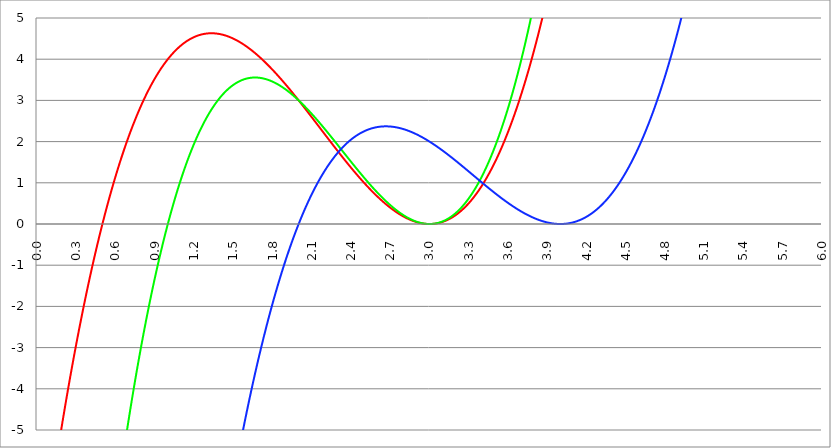
| Category | Series 1 | Series 0 | Series 2 |
|---|---|---|---|
| 0.0 | -9 | -27 | -64 |
| 0.003 | -8.928 | -26.865 | -63.808 |
| 0.006 | -8.856 | -26.731 | -63.617 |
| 0.009 | -8.785 | -26.597 | -63.426 |
| 0.012 | -8.714 | -26.463 | -63.235 |
| 0.015 | -8.643 | -26.33 | -63.044 |
| 0.018 | -8.572 | -26.197 | -62.854 |
| 0.021 | -8.502 | -26.064 | -62.665 |
| 0.024 | -8.431 | -25.932 | -62.475 |
| 0.027 | -8.361 | -25.8 | -62.287 |
| 0.03 | -8.292 | -25.669 | -62.098 |
| 0.033 | -8.222 | -25.538 | -61.91 |
| 0.036 | -8.153 | -25.407 | -61.722 |
| 0.039 | -8.084 | -25.277 | -61.534 |
| 0.042 | -8.015 | -25.147 | -61.347 |
| 0.045 | -7.946 | -25.017 | -61.16 |
| 0.048 | -7.878 | -24.888 | -60.974 |
| 0.051 | -7.81 | -24.759 | -60.788 |
| 0.054 | -7.742 | -24.631 | -60.602 |
| 0.057 | -7.674 | -24.503 | -60.417 |
| 0.06 | -7.606 | -24.375 | -60.232 |
| 0.063 | -7.539 | -24.248 | -60.047 |
| 0.066 | -7.472 | -24.121 | -59.863 |
| 0.069 | -7.405 | -23.994 | -59.679 |
| 0.072 | -7.339 | -23.868 | -59.495 |
| 0.075 | -7.272 | -23.742 | -59.312 |
| 0.078 | -7.206 | -23.616 | -59.129 |
| 0.081 | -7.14 | -23.491 | -58.946 |
| 0.084 | -7.075 | -23.366 | -58.764 |
| 0.087 | -7.009 | -23.242 | -58.582 |
| 0.09 | -6.944 | -23.118 | -58.401 |
| 0.093 | -6.879 | -22.994 | -58.219 |
| 0.096 | -6.814 | -22.871 | -58.039 |
| 0.099 | -6.749 | -22.748 | -57.858 |
| 0.102 | -6.685 | -22.625 | -57.678 |
| 0.105 | -6.621 | -22.503 | -57.498 |
| 0.108 | -6.557 | -22.381 | -57.319 |
| 0.111 | -6.493 | -22.26 | -57.14 |
| 0.114 | -6.43 | -22.138 | -56.961 |
| 0.117 | -6.367 | -22.018 | -56.783 |
| 0.12 | -6.304 | -21.897 | -56.605 |
| 0.123 | -6.241 | -21.777 | -56.427 |
| 0.126 | -6.178 | -21.657 | -56.25 |
| 0.129 | -6.116 | -21.538 | -56.073 |
| 0.132 | -6.054 | -21.419 | -55.896 |
| 0.135 | -5.992 | -21.3 | -55.72 |
| 0.138 | -5.93 | -21.182 | -55.544 |
| 0.141 | -5.869 | -21.064 | -55.368 |
| 0.144 | -5.808 | -20.946 | -55.193 |
| 0.147 | -5.747 | -20.829 | -55.018 |
| 0.15 | -5.686 | -20.712 | -54.843 |
| 0.153 | -5.625 | -20.596 | -54.669 |
| 0.156 | -5.565 | -20.48 | -54.495 |
| 0.159 | -5.505 | -20.364 | -54.322 |
| 0.162 | -5.445 | -20.248 | -54.148 |
| 0.165 | -5.385 | -20.133 | -53.976 |
| 0.168 | -5.325 | -20.018 | -53.803 |
| 0.171 | -5.266 | -19.904 | -53.631 |
| 0.174 | -5.207 | -19.79 | -53.459 |
| 0.177 | -5.148 | -19.676 | -53.287 |
| 0.18 | -5.09 | -19.563 | -53.116 |
| 0.183 | -5.031 | -19.45 | -52.946 |
| 0.186 | -4.973 | -19.337 | -52.775 |
| 0.189 | -4.915 | -19.225 | -52.605 |
| 0.192 | -4.857 | -19.113 | -52.435 |
| 0.195 | -4.799 | -19.001 | -52.266 |
| 0.198 | -4.742 | -18.89 | -52.097 |
| 0.201 | -4.685 | -18.779 | -51.928 |
| 0.204 | -4.628 | -18.668 | -51.759 |
| 0.207 | -4.571 | -18.558 | -51.591 |
| 0.21 | -4.515 | -18.448 | -51.423 |
| 0.213 | -4.458 | -18.339 | -51.256 |
| 0.216 | -4.402 | -18.23 | -51.089 |
| 0.219 | -4.346 | -18.121 | -50.922 |
| 0.222 | -4.291 | -18.012 | -50.756 |
| 0.225 | -4.235 | -17.904 | -50.59 |
| 0.228 | -4.18 | -17.796 | -50.424 |
| 0.231 | -4.125 | -17.689 | -50.259 |
| 0.234 | -4.07 | -17.581 | -50.093 |
| 0.237 | -4.016 | -17.475 | -49.929 |
| 0.24 | -3.961 | -17.368 | -49.764 |
| 0.243 | -3.907 | -17.262 | -49.6 |
| 0.246 | -3.853 | -17.156 | -49.437 |
| 0.249 | -3.799 | -17.051 | -49.273 |
| 0.252 | -3.746 | -16.946 | -49.11 |
| 0.255 | -3.692 | -16.841 | -48.947 |
| 0.258 | -3.639 | -16.736 | -48.785 |
| 0.261 | -3.586 | -16.632 | -48.623 |
| 0.264 | -3.533 | -16.528 | -48.461 |
| 0.267 | -3.481 | -16.425 | -48.3 |
| 0.27 | -3.428 | -16.322 | -48.139 |
| 0.273 | -3.376 | -16.219 | -47.978 |
| 0.276 | -3.324 | -16.117 | -47.817 |
| 0.279 | -3.272 | -16.015 | -47.657 |
| 0.282 | -3.221 | -15.913 | -47.498 |
| 0.285 | -3.17 | -15.811 | -47.338 |
| 0.288 | -3.118 | -15.71 | -47.179 |
| 0.291 | -3.068 | -15.609 | -47.02 |
| 0.294 | -3.017 | -15.509 | -46.862 |
| 0.297 | -2.966 | -15.409 | -46.704 |
| 0.3 | -2.916 | -15.309 | -46.546 |
| 0.303 | -2.866 | -15.21 | -46.389 |
| 0.306 | -2.816 | -15.11 | -46.231 |
| 0.309 | -2.766 | -15.012 | -46.075 |
| 0.312 | -2.717 | -14.913 | -45.918 |
| 0.315 | -2.667 | -14.815 | -45.762 |
| 0.318 | -2.618 | -14.717 | -45.606 |
| 0.321 | -2.569 | -14.62 | -45.451 |
| 0.324 | -2.521 | -14.522 | -45.295 |
| 0.327 | -2.472 | -14.426 | -45.141 |
| 0.33 | -2.424 | -14.329 | -44.986 |
| 0.333 | -2.376 | -14.233 | -44.832 |
| 0.336 | -2.328 | -14.137 | -44.678 |
| 0.339 | -2.28 | -14.041 | -44.525 |
| 0.342 | -2.233 | -13.946 | -44.371 |
| 0.345 | -2.185 | -13.851 | -44.218 |
| 0.348 | -2.138 | -13.757 | -44.066 |
| 0.351 | -2.091 | -13.662 | -43.914 |
| 0.354 | -2.044 | -13.569 | -43.762 |
| 0.357 | -1.998 | -13.475 | -43.61 |
| 0.36 | -1.951 | -13.382 | -43.459 |
| 0.363 | -1.905 | -13.289 | -43.308 |
| 0.366 | -1.859 | -13.196 | -43.157 |
| 0.369 | -1.814 | -13.104 | -43.007 |
| 0.372 | -1.768 | -13.012 | -42.857 |
| 0.375 | -1.723 | -12.92 | -42.707 |
| 0.378 | -1.677 | -12.829 | -42.558 |
| 0.381 | -1.632 | -12.737 | -42.409 |
| 0.384 | -1.588 | -12.647 | -42.26 |
| 0.387 | -1.543 | -12.556 | -42.111 |
| 0.39 | -1.499 | -12.466 | -41.963 |
| 0.393 | -1.454 | -12.376 | -41.816 |
| 0.396 | -1.41 | -12.287 | -41.668 |
| 0.399 | -1.367 | -12.198 | -41.521 |
| 0.402 | -1.323 | -12.109 | -41.374 |
| 0.405 | -1.279 | -12.02 | -41.228 |
| 0.408 | -1.236 | -11.932 | -41.081 |
| 0.411 | -1.193 | -11.844 | -40.936 |
| 0.414 | -1.15 | -11.756 | -40.79 |
| 0.417 | -1.108 | -11.669 | -40.645 |
| 0.42 | -1.065 | -11.582 | -40.5 |
| 0.423 | -1.023 | -11.495 | -40.355 |
| 0.426 | -0.981 | -11.409 | -40.211 |
| 0.429 | -0.939 | -11.323 | -40.067 |
| 0.432 | -0.897 | -11.237 | -39.923 |
| 0.435 | -0.855 | -11.152 | -39.78 |
| 0.438 | -0.814 | -11.067 | -39.637 |
| 0.441 | -0.773 | -10.982 | -39.494 |
| 0.444 | -0.732 | -10.897 | -39.352 |
| 0.447 | -0.691 | -10.813 | -39.21 |
| 0.45 | -0.65 | -10.729 | -39.068 |
| 0.453 | -0.61 | -10.646 | -38.926 |
| 0.456 | -0.57 | -10.562 | -38.785 |
| 0.459 | -0.529 | -10.479 | -38.644 |
| 0.462 | -0.49 | -10.396 | -38.504 |
| 0.465 | -0.45 | -10.314 | -38.363 |
| 0.468 | -0.41 | -10.232 | -38.223 |
| 0.471 | -0.371 | -10.15 | -38.084 |
| 0.474 | -0.332 | -10.069 | -37.945 |
| 0.477 | -0.293 | -9.988 | -37.806 |
| 0.48 | -0.254 | -9.907 | -37.667 |
| 0.483 | -0.215 | -9.826 | -37.528 |
| 0.486 | -0.177 | -9.746 | -37.39 |
| 0.489 | -0.139 | -9.666 | -37.253 |
| 0.492 | -0.101 | -9.586 | -37.115 |
| 0.495 | -0.063 | -9.507 | -36.978 |
| 0.498 | -0.025 | -9.428 | -36.841 |
| 0.501 | 0.012 | -9.349 | -36.705 |
| 0.504 | 0.05 | -9.27 | -36.568 |
| 0.507 | 0.087 | -9.192 | -36.432 |
| 0.51 | 0.124 | -9.114 | -36.297 |
| 0.513 | 0.161 | -9.037 | -36.161 |
| 0.516 | 0.197 | -8.959 | -36.026 |
| 0.519 | 0.234 | -8.882 | -35.892 |
| 0.522 | 0.27 | -8.805 | -35.757 |
| 0.525 | 0.306 | -8.729 | -35.623 |
| 0.528 | 0.342 | -8.653 | -35.489 |
| 0.531 | 0.378 | -8.577 | -35.356 |
| 0.534 | 0.414 | -8.501 | -35.223 |
| 0.537 | 0.449 | -8.426 | -35.09 |
| 0.54 | 0.484 | -8.351 | -34.957 |
| 0.543 | 0.519 | -8.277 | -34.825 |
| 0.546 | 0.554 | -8.202 | -34.693 |
| 0.549 | 0.589 | -8.128 | -34.561 |
| 0.552 | 0.623 | -8.054 | -34.43 |
| 0.555 | 0.658 | -7.981 | -34.299 |
| 0.558 | 0.692 | -7.907 | -34.168 |
| 0.561 | 0.726 | -7.834 | -34.037 |
| 0.564 | 0.76 | -7.762 | -33.907 |
| 0.567 | 0.793 | -7.689 | -33.777 |
| 0.57 | 0.827 | -7.617 | -33.648 |
| 0.573 | 0.86 | -7.546 | -33.518 |
| 0.576 | 0.893 | -7.474 | -33.389 |
| 0.579 | 0.926 | -7.403 | -33.261 |
| 0.582 | 0.959 | -7.332 | -33.132 |
| 0.585 | 0.991 | -7.261 | -33.004 |
| 0.588 | 1.024 | -7.191 | -32.876 |
| 0.591 | 1.056 | -7.121 | -32.749 |
| 0.594 | 1.088 | -7.051 | -32.622 |
| 0.597 | 1.12 | -6.981 | -32.495 |
| 0.6 | 1.152 | -6.912 | -32.368 |
| 0.603 | 1.184 | -6.843 | -32.242 |
| 0.606 | 1.215 | -6.774 | -32.116 |
| 0.609 | 1.246 | -6.706 | -31.99 |
| 0.612 | 1.277 | -6.638 | -31.864 |
| 0.615 | 1.308 | -6.57 | -31.739 |
| 0.618 | 1.339 | -6.502 | -31.614 |
| 0.621 | 1.37 | -6.435 | -31.49 |
| 0.624 | 1.4 | -6.368 | -31.366 |
| 0.627 | 1.43 | -6.301 | -31.242 |
| 0.63 | 1.46 | -6.235 | -31.118 |
| 0.633 | 1.49 | -6.169 | -30.995 |
| 0.636 | 1.52 | -6.103 | -30.871 |
| 0.639 | 1.55 | -6.037 | -30.749 |
| 0.642 | 1.579 | -5.972 | -30.626 |
| 0.645 | 1.608 | -5.907 | -30.504 |
| 0.648 | 1.637 | -5.842 | -30.382 |
| 0.651 | 1.666 | -5.777 | -30.26 |
| 0.654 | 1.695 | -5.713 | -30.139 |
| 0.657 | 1.724 | -5.649 | -30.018 |
| 0.66 | 1.752 | -5.585 | -29.897 |
| 0.663 | 1.78 | -5.522 | -29.777 |
| 0.666 | 1.809 | -5.458 | -29.656 |
| 0.669 | 1.837 | -5.396 | -29.536 |
| 0.672 | 1.864 | -5.333 | -29.417 |
| 0.675 | 1.892 | -5.27 | -29.297 |
| 0.678 | 1.919 | -5.208 | -29.178 |
| 0.681 | 1.947 | -5.147 | -29.06 |
| 0.684 | 1.974 | -5.085 | -28.941 |
| 0.687 | 2.001 | -5.024 | -28.823 |
| 0.69 | 2.028 | -4.963 | -28.705 |
| 0.693 | 2.054 | -4.902 | -28.587 |
| 0.696 | 2.081 | -4.841 | -28.47 |
| 0.699 | 2.107 | -4.781 | -28.353 |
| 0.702 | 2.133 | -4.721 | -28.236 |
| 0.705 | 2.159 | -4.661 | -28.12 |
| 0.708 | 2.185 | -4.602 | -28.003 |
| 0.711 | 2.211 | -4.543 | -27.888 |
| 0.714 | 2.237 | -4.484 | -27.772 |
| 0.717 | 2.262 | -4.425 | -27.657 |
| 0.72 | 2.287 | -4.367 | -27.542 |
| 0.723 | 2.312 | -4.309 | -27.427 |
| 0.726 | 2.337 | -4.251 | -27.312 |
| 0.729 | 2.362 | -4.193 | -27.198 |
| 0.732 | 2.387 | -4.136 | -27.084 |
| 0.735 | 2.411 | -4.079 | -26.97 |
| 0.738 | 2.436 | -4.022 | -26.857 |
| 0.741 | 2.46 | -3.965 | -26.744 |
| 0.744 | 2.484 | -3.909 | -26.631 |
| 0.747 | 2.508 | -3.853 | -26.519 |
| 0.75 | 2.531 | -3.797 | -26.406 |
| 0.753 | 2.555 | -3.741 | -26.294 |
| 0.756 | 2.578 | -3.686 | -26.183 |
| 0.759 | 2.601 | -3.631 | -26.071 |
| 0.762 | 2.625 | -3.576 | -25.96 |
| 0.765 | 2.647 | -3.522 | -25.849 |
| 0.768 | 2.67 | -3.467 | -25.739 |
| 0.771000000000001 | 2.693 | -3.413 | -25.628 |
| 0.774000000000001 | 2.715 | -3.36 | -25.518 |
| 0.777000000000001 | 2.738 | -3.306 | -25.408 |
| 0.78 | 2.76 | -3.253 | -25.299 |
| 0.783000000000001 | 2.782 | -3.2 | -25.19 |
| 0.786000000000001 | 2.804 | -3.147 | -25.081 |
| 0.789000000000001 | 2.826 | -3.094 | -24.972 |
| 0.792000000000001 | 2.847 | -3.042 | -24.864 |
| 0.795000000000001 | 2.869 | -2.99 | -24.756 |
| 0.798000000000001 | 2.89 | -2.938 | -24.648 |
| 0.801000000000001 | 2.911 | -2.887 | -24.54 |
| 0.804000000000001 | 2.932 | -2.836 | -24.433 |
| 0.807000000000001 | 2.953 | -2.785 | -24.326 |
| 0.810000000000001 | 2.974 | -2.734 | -24.219 |
| 0.813000000000001 | 2.994 | -2.683 | -24.113 |
| 0.816000000000001 | 3.015 | -2.633 | -24.006 |
| 0.819000000000001 | 3.035 | -2.583 | -23.901 |
| 0.822000000000001 | 3.055 | -2.533 | -23.795 |
| 0.825000000000001 | 3.075 | -2.484 | -23.689 |
| 0.828000000000001 | 3.095 | -2.434 | -23.584 |
| 0.831000000000001 | 3.114 | -2.385 | -23.48 |
| 0.834000000000001 | 3.134 | -2.336 | -23.375 |
| 0.837000000000001 | 3.153 | -2.288 | -23.271 |
| 0.840000000000001 | 3.173 | -2.239 | -23.167 |
| 0.843000000000001 | 3.192 | -2.191 | -23.063 |
| 0.846000000000001 | 3.211 | -2.144 | -22.959 |
| 0.849000000000001 | 3.23 | -2.096 | -22.856 |
| 0.852000000000001 | 3.248 | -2.049 | -22.753 |
| 0.855000000000001 | 3.267 | -2.001 | -22.65 |
| 0.858000000000001 | 3.285 | -1.955 | -22.548 |
| 0.861000000000001 | 3.303 | -1.908 | -22.446 |
| 0.864000000000001 | 3.321 | -1.861 | -22.344 |
| 0.867000000000001 | 3.339 | -1.815 | -22.242 |
| 0.870000000000001 | 3.357 | -1.769 | -22.141 |
| 0.873000000000001 | 3.375 | -1.724 | -22.04 |
| 0.876000000000001 | 3.393 | -1.678 | -21.939 |
| 0.879000000000001 | 3.41 | -1.633 | -21.839 |
| 0.882000000000001 | 3.427 | -1.588 | -21.738 |
| 0.885000000000001 | 3.444 | -1.543 | -21.638 |
| 0.888000000000001 | 3.461 | -1.499 | -21.538 |
| 0.891000000000001 | 3.478 | -1.454 | -21.439 |
| 0.894000000000001 | 3.495 | -1.41 | -21.34 |
| 0.897000000000001 | 3.512 | -1.367 | -21.241 |
| 0.900000000000001 | 3.528 | -1.323 | -21.142 |
| 0.903000000000001 | 3.544 | -1.28 | -21.044 |
| 0.906000000000001 | 3.56 | -1.237 | -20.945 |
| 0.909000000000001 | 3.577 | -1.194 | -20.847 |
| 0.912000000000001 | 3.592 | -1.151 | -20.75 |
| 0.915000000000001 | 3.608 | -1.109 | -20.652 |
| 0.918000000000001 | 3.624 | -1.066 | -20.555 |
| 0.921000000000001 | 3.639 | -1.024 | -20.458 |
| 0.924000000000001 | 3.655 | -0.983 | -20.362 |
| 0.927000000000001 | 3.67 | -0.941 | -20.265 |
| 0.930000000000001 | 3.685 | -0.9 | -20.169 |
| 0.933000000000001 | 3.7 | -0.859 | -20.073 |
| 0.936000000000001 | 3.715 | -0.818 | -19.978 |
| 0.939000000000001 | 3.729 | -0.777 | -19.883 |
| 0.942000000000001 | 3.744 | -0.737 | -19.787 |
| 0.945000000000001 | 3.758 | -0.697 | -19.693 |
| 0.948000000000001 | 3.773 | -0.657 | -19.598 |
| 0.951000000000001 | 3.787 | -0.617 | -19.504 |
| 0.954000000000001 | 3.801 | -0.578 | -19.41 |
| 0.957000000000001 | 3.815 | -0.538 | -19.316 |
| 0.960000000000001 | 3.829 | -0.499 | -19.223 |
| 0.963000000000001 | 3.842 | -0.461 | -19.129 |
| 0.966000000000001 | 3.856 | -0.422 | -19.036 |
| 0.969000000000001 | 3.869 | -0.384 | -18.944 |
| 0.972000000000001 | 3.882 | -0.345 | -18.851 |
| 0.975000000000001 | 3.896 | -0.308 | -18.759 |
| 0.978000000000001 | 3.909 | -0.27 | -18.667 |
| 0.981000000000001 | 3.921 | -0.232 | -18.575 |
| 0.984000000000001 | 3.934 | -0.195 | -18.484 |
| 0.987000000000001 | 3.947 | -0.158 | -18.392 |
| 0.990000000000001 | 3.959 | -0.121 | -18.301 |
| 0.993000000000001 | 3.972 | -0.085 | -18.211 |
| 0.996000000000001 | 3.984 | -0.048 | -18.12 |
| 0.999000000000001 | 3.996 | -0.012 | -18.03 |
| 1.002000000000001 | 4.008 | 0.024 | -17.94 |
| 1.005000000000001 | 4.02 | 0.06 | -17.85 |
| 1.008 | 4.032 | 0.095 | -17.761 |
| 1.011 | 4.043 | 0.131 | -17.672 |
| 1.014 | 4.055 | 0.166 | -17.583 |
| 1.017 | 4.066 | 0.201 | -17.494 |
| 1.02 | 4.077 | 0.235 | -17.406 |
| 1.023 | 4.088 | 0.27 | -17.317 |
| 1.026 | 4.099 | 0.304 | -17.229 |
| 1.029 | 4.11 | 0.338 | -17.142 |
| 1.032 | 4.121 | 0.372 | -17.054 |
| 1.034999999999999 | 4.132 | 0.405 | -16.967 |
| 1.037999999999999 | 4.142 | 0.439 | -16.88 |
| 1.040999999999999 | 4.152 | 0.472 | -16.793 |
| 1.043999999999999 | 4.163 | 0.505 | -16.707 |
| 1.046999999999999 | 4.173 | 0.538 | -16.621 |
| 1.049999999999999 | 4.183 | 0.57 | -16.535 |
| 1.052999999999999 | 4.193 | 0.603 | -16.449 |
| 1.055999999999999 | 4.202 | 0.635 | -16.364 |
| 1.058999999999999 | 4.212 | 0.667 | -16.278 |
| 1.061999999999998 | 4.222 | 0.699 | -16.193 |
| 1.064999999999998 | 4.231 | 0.73 | -16.109 |
| 1.067999999999998 | 4.24 | 0.761 | -16.024 |
| 1.070999999999998 | 4.249 | 0.793 | -15.94 |
| 1.073999999999998 | 4.258 | 0.824 | -15.856 |
| 1.076999999999998 | 4.267 | 0.854 | -15.772 |
| 1.079999999999998 | 4.276 | 0.885 | -15.689 |
| 1.082999999999998 | 4.285 | 0.915 | -15.605 |
| 1.085999999999998 | 4.294 | 0.945 | -15.522 |
| 1.088999999999998 | 4.302 | 0.975 | -15.439 |
| 1.091999999999997 | 4.31 | 1.005 | -15.357 |
| 1.094999999999997 | 4.319 | 1.034 | -15.275 |
| 1.097999999999997 | 4.327 | 1.064 | -15.193 |
| 1.100999999999997 | 4.335 | 1.093 | -15.111 |
| 1.103999999999997 | 4.343 | 1.122 | -15.029 |
| 1.106999999999997 | 4.35 | 1.15 | -14.948 |
| 1.109999999999997 | 4.358 | 1.179 | -14.867 |
| 1.112999999999997 | 4.366 | 1.207 | -14.786 |
| 1.115999999999997 | 4.373 | 1.235 | -14.705 |
| 1.118999999999996 | 4.38 | 1.263 | -14.625 |
| 1.121999999999996 | 4.387 | 1.291 | -14.545 |
| 1.124999999999996 | 4.395 | 1.318 | -14.465 |
| 1.127999999999996 | 4.402 | 1.346 | -14.385 |
| 1.130999999999996 | 4.408 | 1.373 | -14.306 |
| 1.133999999999996 | 4.415 | 1.4 | -14.227 |
| 1.136999999999996 | 4.422 | 1.426 | -14.148 |
| 1.139999999999996 | 4.428 | 1.453 | -14.069 |
| 1.142999999999996 | 4.435 | 1.479 | -13.99 |
| 1.145999999999995 | 4.441 | 1.506 | -13.912 |
| 1.148999999999995 | 4.447 | 1.532 | -13.834 |
| 1.151999999999995 | 4.453 | 1.557 | -13.756 |
| 1.154999999999995 | 4.459 | 1.583 | -13.679 |
| 1.157999999999995 | 4.465 | 1.608 | -13.602 |
| 1.160999999999995 | 4.471 | 1.633 | -13.525 |
| 1.163999999999995 | 4.477 | 1.658 | -13.448 |
| 1.166999999999995 | 4.482 | 1.683 | -13.371 |
| 1.169999999999995 | 4.488 | 1.708 | -13.295 |
| 1.172999999999994 | 4.493 | 1.732 | -13.219 |
| 1.175999999999994 | 4.498 | 1.757 | -13.143 |
| 1.178999999999994 | 4.503 | 1.781 | -13.067 |
| 1.181999999999994 | 4.508 | 1.805 | -12.992 |
| 1.184999999999994 | 4.513 | 1.828 | -12.916 |
| 1.187999999999994 | 4.518 | 1.852 | -12.842 |
| 1.190999999999994 | 4.523 | 1.875 | -12.767 |
| 1.193999999999994 | 4.527 | 1.898 | -12.692 |
| 1.196999999999994 | 4.532 | 1.921 | -12.618 |
| 1.199999999999993 | 4.536 | 1.944 | -12.544 |
| 1.202999999999993 | 4.54 | 1.967 | -12.47 |
| 1.205999999999993 | 4.544 | 1.989 | -12.397 |
| 1.208999999999993 | 4.548 | 2.011 | -12.323 |
| 1.211999999999993 | 4.552 | 2.033 | -12.25 |
| 1.214999999999993 | 4.556 | 2.055 | -12.177 |
| 1.217999999999993 | 4.56 | 2.077 | -12.105 |
| 1.220999999999993 | 4.564 | 2.098 | -12.032 |
| 1.223999999999993 | 4.567 | 2.12 | -11.96 |
| 1.226999999999993 | 4.571 | 2.141 | -11.888 |
| 1.229999999999992 | 4.574 | 2.162 | -11.816 |
| 1.232999999999992 | 4.577 | 2.182 | -11.745 |
| 1.235999999999992 | 4.58 | 2.203 | -11.673 |
| 1.238999999999992 | 4.583 | 2.224 | -11.602 |
| 1.241999999999992 | 4.586 | 2.244 | -11.532 |
| 1.244999999999992 | 4.589 | 2.264 | -11.461 |
| 1.247999999999992 | 4.592 | 2.284 | -11.391 |
| 1.250999999999992 | 4.595 | 2.303 | -11.32 |
| 1.253999999999992 | 4.597 | 2.323 | -11.25 |
| 1.256999999999991 | 4.6 | 2.342 | -11.181 |
| 1.259999999999991 | 4.602 | 2.362 | -11.111 |
| 1.262999999999991 | 4.604 | 2.381 | -11.042 |
| 1.265999999999991 | 4.606 | 2.399 | -10.973 |
| 1.268999999999991 | 4.608 | 2.418 | -10.904 |
| 1.271999999999991 | 4.61 | 2.437 | -10.836 |
| 1.274999999999991 | 4.612 | 2.455 | -10.767 |
| 1.277999999999991 | 4.614 | 2.473 | -10.699 |
| 1.280999999999991 | 4.616 | 2.491 | -10.631 |
| 1.28399999999999 | 4.617 | 2.509 | -10.563 |
| 1.28699999999999 | 4.619 | 2.526 | -10.496 |
| 1.28999999999999 | 4.62 | 2.544 | -10.429 |
| 1.29299999999999 | 4.621 | 2.561 | -10.362 |
| 1.29599999999999 | 4.623 | 2.578 | -10.295 |
| 1.29899999999999 | 4.624 | 2.595 | -10.228 |
| 1.30199999999999 | 4.625 | 2.612 | -10.162 |
| 1.30499999999999 | 4.626 | 2.629 | -10.096 |
| 1.30799999999999 | 4.626 | 2.645 | -10.03 |
| 1.310999999999989 | 4.627 | 2.662 | -9.964 |
| 1.313999999999989 | 4.628 | 2.678 | -9.898 |
| 1.316999999999989 | 4.628 | 2.694 | -9.833 |
| 1.319999999999989 | 4.629 | 2.71 | -9.768 |
| 1.322999999999989 | 4.629 | 2.725 | -9.703 |
| 1.325999999999989 | 4.629 | 2.741 | -9.639 |
| 1.328999999999989 | 4.63 | 2.756 | -9.574 |
| 1.331999999999989 | 4.63 | 2.771 | -9.51 |
| 1.334999999999989 | 4.63 | 2.786 | -9.446 |
| 1.337999999999988 | 4.63 | 2.801 | -9.382 |
| 1.340999999999988 | 4.629 | 2.816 | -9.319 |
| 1.343999999999988 | 4.629 | 2.83 | -9.255 |
| 1.346999999999988 | 4.629 | 2.844 | -9.192 |
| 1.349999999999988 | 4.628 | 2.859 | -9.129 |
| 1.352999999999988 | 4.628 | 2.873 | -9.067 |
| 1.355999999999988 | 4.627 | 2.887 | -9.004 |
| 1.358999999999988 | 4.626 | 2.9 | -8.942 |
| 1.361999999999988 | 4.626 | 2.914 | -8.88 |
| 1.364999999999987 | 4.625 | 2.927 | -8.818 |
| 1.367999999999987 | 4.624 | 2.94 | -8.756 |
| 1.370999999999987 | 4.623 | 2.954 | -8.695 |
| 1.373999999999987 | 4.621 | 2.966 | -8.634 |
| 1.376999999999987 | 4.62 | 2.979 | -8.573 |
| 1.379999999999987 | 4.619 | 2.992 | -8.512 |
| 1.382999999999987 | 4.618 | 3.004 | -8.451 |
| 1.385999999999987 | 4.616 | 3.017 | -8.391 |
| 1.388999999999987 | 4.614 | 3.029 | -8.331 |
| 1.391999999999987 | 4.613 | 3.041 | -8.271 |
| 1.394999999999986 | 4.611 | 3.053 | -8.211 |
| 1.397999999999986 | 4.609 | 3.064 | -8.152 |
| 1.400999999999986 | 4.607 | 3.076 | -8.092 |
| 1.403999999999986 | 4.605 | 3.087 | -8.033 |
| 1.406999999999986 | 4.603 | 3.098 | -7.974 |
| 1.409999999999986 | 4.601 | 3.11 | -7.916 |
| 1.412999999999986 | 4.599 | 3.121 | -7.857 |
| 1.415999999999986 | 4.597 | 3.131 | -7.799 |
| 1.418999999999986 | 4.594 | 3.142 | -7.741 |
| 1.421999999999985 | 4.592 | 3.152 | -7.683 |
| 1.424999999999985 | 4.589 | 3.163 | -7.625 |
| 1.427999999999985 | 4.587 | 3.173 | -7.568 |
| 1.430999999999985 | 4.584 | 3.183 | -7.511 |
| 1.433999999999985 | 4.581 | 3.193 | -7.453 |
| 1.436999999999985 | 4.578 | 3.203 | -7.397 |
| 1.439999999999985 | 4.575 | 3.212 | -7.34 |
| 1.442999999999985 | 4.572 | 3.222 | -7.284 |
| 1.445999999999985 | 4.569 | 3.231 | -7.227 |
| 1.448999999999984 | 4.566 | 3.24 | -7.171 |
| 1.451999999999984 | 4.563 | 3.249 | -7.116 |
| 1.454999999999984 | 4.559 | 3.258 | -7.06 |
| 1.457999999999984 | 4.556 | 3.267 | -7.005 |
| 1.460999999999984 | 4.552 | 3.276 | -6.949 |
| 1.463999999999984 | 4.549 | 3.284 | -6.894 |
| 1.466999999999984 | 4.545 | 3.292 | -6.84 |
| 1.469999999999984 | 4.541 | 3.301 | -6.785 |
| 1.472999999999984 | 4.538 | 3.309 | -6.731 |
| 1.475999999999984 | 4.534 | 3.317 | -6.676 |
| 1.478999999999983 | 4.53 | 3.324 | -6.622 |
| 1.481999999999983 | 4.526 | 3.332 | -6.569 |
| 1.484999999999983 | 4.522 | 3.34 | -6.515 |
| 1.487999999999983 | 4.517 | 3.347 | -6.462 |
| 1.490999999999983 | 4.513 | 3.354 | -6.408 |
| 1.493999999999983 | 4.509 | 3.361 | -6.355 |
| 1.496999999999983 | 4.504 | 3.368 | -6.303 |
| 1.499999999999983 | 4.5 | 3.375 | -6.25 |
| 1.502999999999983 | 4.495 | 3.382 | -6.198 |
| 1.505999999999982 | 4.491 | 3.388 | -6.145 |
| 1.508999999999982 | 4.486 | 3.395 | -6.093 |
| 1.511999999999982 | 4.481 | 3.401 | -6.042 |
| 1.514999999999982 | 4.477 | 3.407 | -5.99 |
| 1.517999999999982 | 4.472 | 3.413 | -5.939 |
| 1.520999999999982 | 4.467 | 3.419 | -5.887 |
| 1.523999999999982 | 4.462 | 3.425 | -5.836 |
| 1.526999999999982 | 4.457 | 3.43 | -5.785 |
| 1.529999999999982 | 4.451 | 3.436 | -5.735 |
| 1.532999999999981 | 4.446 | 3.441 | -5.684 |
| 1.535999999999981 | 4.441 | 3.446 | -5.634 |
| 1.538999999999981 | 4.436 | 3.452 | -5.584 |
| 1.541999999999981 | 4.43 | 3.456 | -5.534 |
| 1.544999999999981 | 4.425 | 3.461 | -5.485 |
| 1.547999999999981 | 4.419 | 3.466 | -5.435 |
| 1.550999999999981 | 4.413 | 3.471 | -5.386 |
| 1.553999999999981 | 4.408 | 3.475 | -5.337 |
| 1.556999999999981 | 4.402 | 3.479 | -5.288 |
| 1.559999999999981 | 4.396 | 3.484 | -5.239 |
| 1.56299999999998 | 4.39 | 3.488 | -5.191 |
| 1.56599999999998 | 4.384 | 3.492 | -5.142 |
| 1.56899999999998 | 4.378 | 3.496 | -5.094 |
| 1.57199999999998 | 4.372 | 3.499 | -5.046 |
| 1.57499999999998 | 4.366 | 3.503 | -4.999 |
| 1.57799999999998 | 4.36 | 3.506 | -4.951 |
| 1.58099999999998 | 4.353 | 3.51 | -4.904 |
| 1.58399999999998 | 4.347 | 3.513 | -4.856 |
| 1.58699999999998 | 4.341 | 3.516 | -4.809 |
| 1.589999999999979 | 4.334 | 3.519 | -4.763 |
| 1.592999999999979 | 4.328 | 3.522 | -4.716 |
| 1.595999999999979 | 4.321 | 3.525 | -4.67 |
| 1.598999999999979 | 4.314 | 3.527 | -4.623 |
| 1.601999999999979 | 4.308 | 3.53 | -4.577 |
| 1.604999999999979 | 4.301 | 3.532 | -4.531 |
| 1.607999999999979 | 4.294 | 3.534 | -4.486 |
| 1.610999999999979 | 4.287 | 3.536 | -4.44 |
| 1.613999999999978 | 4.28 | 3.538 | -4.395 |
| 1.616999999999978 | 4.273 | 3.54 | -4.35 |
| 1.619999999999978 | 4.266 | 3.542 | -4.305 |
| 1.622999999999978 | 4.259 | 3.544 | -4.26 |
| 1.625999999999978 | 4.251 | 3.545 | -4.216 |
| 1.628999999999978 | 4.244 | 3.547 | -4.171 |
| 1.631999999999978 | 4.237 | 3.548 | -4.127 |
| 1.634999999999978 | 4.23 | 3.549 | -4.083 |
| 1.637999999999978 | 4.222 | 3.551 | -4.039 |
| 1.640999999999977 | 4.215 | 3.552 | -3.996 |
| 1.643999999999977 | 4.207 | 3.552 | -3.952 |
| 1.646999999999977 | 4.199 | 3.553 | -3.909 |
| 1.649999999999977 | 4.192 | 3.554 | -3.866 |
| 1.652999999999977 | 4.184 | 3.554 | -3.823 |
| 1.655999999999977 | 4.176 | 3.555 | -3.78 |
| 1.658999999999977 | 4.168 | 3.555 | -3.738 |
| 1.661999999999977 | 4.161 | 3.555 | -3.695 |
| 1.664999999999977 | 4.153 | 3.556 | -3.653 |
| 1.667999999999977 | 4.145 | 3.556 | -3.611 |
| 1.670999999999976 | 4.137 | 3.555 | -3.569 |
| 1.673999999999976 | 4.128 | 3.555 | -3.527 |
| 1.676999999999976 | 4.12 | 3.555 | -3.486 |
| 1.679999999999976 | 4.112 | 3.554 | -3.445 |
| 1.682999999999976 | 4.104 | 3.554 | -3.404 |
| 1.685999999999976 | 4.095 | 3.553 | -3.363 |
| 1.688999999999976 | 4.087 | 3.553 | -3.322 |
| 1.691999999999976 | 4.079 | 3.552 | -3.281 |
| 1.694999999999976 | 4.07 | 3.551 | -3.241 |
| 1.697999999999975 | 4.062 | 3.55 | -3.201 |
| 1.700999999999975 | 4.053 | 3.549 | -3.161 |
| 1.703999999999975 | 4.045 | 3.547 | -3.121 |
| 1.706999999999975 | 4.036 | 3.546 | -3.081 |
| 1.709999999999975 | 4.027 | 3.545 | -3.042 |
| 1.712999999999975 | 4.018 | 3.543 | -3.002 |
| 1.715999999999975 | 4.01 | 3.541 | -2.963 |
| 1.718999999999975 | 4.001 | 3.54 | -2.924 |
| 1.721999999999975 | 3.992 | 3.538 | -2.885 |
| 1.724999999999974 | 3.983 | 3.536 | -2.847 |
| 1.727999999999974 | 3.974 | 3.534 | -2.808 |
| 1.730999999999974 | 3.965 | 3.532 | -2.77 |
| 1.733999999999974 | 3.956 | 3.529 | -2.732 |
| 1.736999999999974 | 3.946 | 3.527 | -2.694 |
| 1.739999999999974 | 3.937 | 3.524 | -2.656 |
| 1.742999999999974 | 3.928 | 3.522 | -2.618 |
| 1.745999999999974 | 3.919 | 3.519 | -2.581 |
| 1.748999999999974 | 3.909 | 3.517 | -2.544 |
| 1.751999999999974 | 3.9 | 3.514 | -2.507 |
| 1.754999999999973 | 3.891 | 3.511 | -2.47 |
| 1.757999999999973 | 3.881 | 3.508 | -2.433 |
| 1.760999999999973 | 3.872 | 3.505 | -2.396 |
| 1.763999999999973 | 3.862 | 3.501 | -2.36 |
| 1.766999999999973 | 3.852 | 3.498 | -2.324 |
| 1.769999999999973 | 3.843 | 3.495 | -2.288 |
| 1.772999999999973 | 3.833 | 3.491 | -2.252 |
| 1.775999999999973 | 3.823 | 3.488 | -2.216 |
| 1.778999999999973 | 3.814 | 3.484 | -2.18 |
| 1.781999999999972 | 3.804 | 3.48 | -2.145 |
| 1.784999999999972 | 3.794 | 3.477 | -2.11 |
| 1.787999999999972 | 3.784 | 3.473 | -2.075 |
| 1.790999999999972 | 3.774 | 3.469 | -2.04 |
| 1.793999999999972 | 3.764 | 3.464 | -2.005 |
| 1.796999999999972 | 3.754 | 3.46 | -1.97 |
| 1.799999999999972 | 3.744 | 3.456 | -1.936 |
| 1.802999999999972 | 3.734 | 3.452 | -1.902 |
| 1.805999999999972 | 3.724 | 3.447 | -1.868 |
| 1.808999999999971 | 3.714 | 3.443 | -1.834 |
| 1.811999999999971 | 3.703 | 3.438 | -1.8 |
| 1.814999999999971 | 3.693 | 3.433 | -1.766 |
| 1.817999999999971 | 3.683 | 3.429 | -1.733 |
| 1.820999999999971 | 3.672 | 3.424 | -1.7 |
| 1.823999999999971 | 3.662 | 3.419 | -1.667 |
| 1.826999999999971 | 3.652 | 3.414 | -1.634 |
| 1.829999999999971 | 3.641 | 3.409 | -1.601 |
| 1.832999999999971 | 3.631 | 3.403 | -1.568 |
| 1.83599999999997 | 3.62 | 3.398 | -1.536 |
| 1.83899999999997 | 3.61 | 3.393 | -1.504 |
| 1.84199999999997 | 3.599 | 3.387 | -1.472 |
| 1.84499999999997 | 3.589 | 3.382 | -1.44 |
| 1.84799999999997 | 3.578 | 3.376 | -1.408 |
| 1.85099999999997 | 3.567 | 3.37 | -1.376 |
| 1.85399999999997 | 3.556 | 3.365 | -1.345 |
| 1.85699999999997 | 3.546 | 3.359 | -1.313 |
| 1.85999999999997 | 3.535 | 3.353 | -1.282 |
| 1.86299999999997 | 3.524 | 3.347 | -1.251 |
| 1.865999999999969 | 3.513 | 3.341 | -1.22 |
| 1.868999999999969 | 3.502 | 3.335 | -1.19 |
| 1.871999999999969 | 3.491 | 3.329 | -1.159 |
| 1.874999999999969 | 3.48 | 3.322 | -1.129 |
| 1.877999999999969 | 3.469 | 3.316 | -1.099 |
| 1.880999999999969 | 3.458 | 3.309 | -1.069 |
| 1.883999999999969 | 3.447 | 3.303 | -1.039 |
| 1.886999999999969 | 3.436 | 3.296 | -1.009 |
| 1.889999999999969 | 3.425 | 3.29 | -0.979 |
| 1.892999999999968 | 3.414 | 3.283 | -0.95 |
| 1.895999999999968 | 3.403 | 3.276 | -0.921 |
| 1.898999999999968 | 3.392 | 3.269 | -0.892 |
| 1.901999999999968 | 3.381 | 3.262 | -0.863 |
| 1.904999999999968 | 3.369 | 3.255 | -0.834 |
| 1.907999999999968 | 3.358 | 3.248 | -0.805 |
| 1.910999999999968 | 3.347 | 3.241 | -0.777 |
| 1.913999999999968 | 3.335 | 3.234 | -0.748 |
| 1.916999999999968 | 3.324 | 3.227 | -0.72 |
| 1.919999999999967 | 3.313 | 3.219 | -0.692 |
| 1.922999999999967 | 3.301 | 3.212 | -0.664 |
| 1.925999999999967 | 3.29 | 3.204 | -0.637 |
| 1.928999999999967 | 3.278 | 3.197 | -0.609 |
| 1.931999999999967 | 3.267 | 3.189 | -0.582 |
| 1.934999999999967 | 3.255 | 3.182 | -0.554 |
| 1.937999999999967 | 3.244 | 3.174 | -0.527 |
| 1.940999999999967 | 3.232 | 3.166 | -0.5 |
| 1.943999999999967 | 3.221 | 3.158 | -0.473 |
| 1.946999999999967 | 3.209 | 3.15 | -0.447 |
| 1.949999999999966 | 3.197 | 3.142 | -0.42 |
| 1.952999999999966 | 3.186 | 3.134 | -0.394 |
| 1.955999999999966 | 3.174 | 3.126 | -0.368 |
| 1.958999999999966 | 3.162 | 3.118 | -0.342 |
| 1.961999999999966 | 3.15 | 3.11 | -0.316 |
| 1.964999999999966 | 3.139 | 3.101 | -0.29 |
| 1.967999999999966 | 3.127 | 3.093 | -0.264 |
| 1.970999999999966 | 3.115 | 3.084 | -0.239 |
| 1.973999999999966 | 3.103 | 3.076 | -0.213 |
| 1.976999999999965 | 3.091 | 3.067 | -0.188 |
| 1.979999999999965 | 3.08 | 3.059 | -0.163 |
| 1.982999999999965 | 3.068 | 3.05 | -0.138 |
| 1.985999999999965 | 3.056 | 3.041 | -0.114 |
| 1.988999999999965 | 3.044 | 3.033 | -0.089 |
| 1.991999999999965 | 3.032 | 3.024 | -0.065 |
| 1.994999999999965 | 3.02 | 3.015 | -0.04 |
| 1.997999999999965 | 3.008 | 3.006 | -0.016 |
| 2.000999999999965 | 2.996 | 2.997 | 0.008 |
| 2.003999999999965 | 2.984 | 2.988 | 0.032 |
| 2.006999999999965 | 2.972 | 2.979 | 0.056 |
| 2.009999999999965 | 2.96 | 2.97 | 0.079 |
| 2.012999999999965 | 2.948 | 2.96 | 0.103 |
| 2.015999999999965 | 2.936 | 2.951 | 0.126 |
| 2.018999999999965 | 2.924 | 2.942 | 0.149 |
| 2.021999999999966 | 2.912 | 2.933 | 0.172 |
| 2.024999999999966 | 2.899 | 2.923 | 0.195 |
| 2.027999999999966 | 2.887 | 2.914 | 0.218 |
| 2.030999999999966 | 2.875 | 2.904 | 0.24 |
| 2.033999999999966 | 2.863 | 2.895 | 0.263 |
| 2.036999999999966 | 2.851 | 2.885 | 0.285 |
| 2.039999999999966 | 2.839 | 2.875 | 0.307 |
| 2.042999999999966 | 2.826 | 2.866 | 0.329 |
| 2.045999999999967 | 2.814 | 2.856 | 0.351 |
| 2.048999999999967 | 2.802 | 2.846 | 0.373 |
| 2.051999999999967 | 2.79 | 2.836 | 0.395 |
| 2.054999999999967 | 2.777 | 2.826 | 0.416 |
| 2.057999999999967 | 2.765 | 2.816 | 0.437 |
| 2.060999999999967 | 2.753 | 2.807 | 0.459 |
| 2.063999999999967 | 2.74 | 2.796 | 0.48 |
| 2.066999999999967 | 2.728 | 2.786 | 0.501 |
| 2.069999999999967 | 2.716 | 2.776 | 0.521 |
| 2.072999999999968 | 2.703 | 2.766 | 0.542 |
| 2.075999999999968 | 2.691 | 2.756 | 0.563 |
| 2.078999999999968 | 2.679 | 2.746 | 0.583 |
| 2.081999999999968 | 2.666 | 2.735 | 0.603 |
| 2.084999999999968 | 2.654 | 2.725 | 0.623 |
| 2.087999999999968 | 2.642 | 2.715 | 0.643 |
| 2.090999999999968 | 2.629 | 2.704 | 0.663 |
| 2.093999999999968 | 2.617 | 2.694 | 0.683 |
| 2.096999999999968 | 2.604 | 2.684 | 0.703 |
| 2.099999999999969 | 2.592 | 2.673 | 0.722 |
| 2.102999999999969 | 2.58 | 2.662 | 0.741 |
| 2.105999999999969 | 2.567 | 2.652 | 0.76 |
| 2.108999999999969 | 2.555 | 2.641 | 0.78 |
| 2.111999999999969 | 2.542 | 2.631 | 0.798 |
| 2.114999999999969 | 2.53 | 2.62 | 0.817 |
| 2.117999999999969 | 2.517 | 2.609 | 0.836 |
| 2.120999999999969 | 2.505 | 2.598 | 0.854 |
| 2.123999999999969 | 2.492 | 2.588 | 0.873 |
| 2.12699999999997 | 2.48 | 2.577 | 0.891 |
| 2.12999999999997 | 2.467 | 2.566 | 0.909 |
| 2.13299999999997 | 2.455 | 2.555 | 0.927 |
| 2.13599999999997 | 2.443 | 2.544 | 0.945 |
| 2.13899999999997 | 2.43 | 2.533 | 0.963 |
| 2.14199999999997 | 2.418 | 2.522 | 0.98 |
| 2.14499999999997 | 2.405 | 2.511 | 0.998 |
| 2.14799999999997 | 2.393 | 2.5 | 1.015 |
| 2.15099999999997 | 2.38 | 2.489 | 1.032 |
| 2.153999999999971 | 2.368 | 2.478 | 1.05 |
| 2.156999999999971 | 2.355 | 2.467 | 1.067 |
| 2.159999999999971 | 2.343 | 2.455 | 1.083 |
| 2.162999999999971 | 2.33 | 2.444 | 1.1 |
| 2.165999999999971 | 2.318 | 2.433 | 1.117 |
| 2.168999999999971 | 2.305 | 2.422 | 1.133 |
| 2.171999999999971 | 2.293 | 2.411 | 1.15 |
| 2.174999999999971 | 2.28 | 2.399 | 1.166 |
| 2.177999999999971 | 2.268 | 2.388 | 1.182 |
| 2.180999999999972 | 2.255 | 2.377 | 1.198 |
| 2.183999999999972 | 2.243 | 2.365 | 1.214 |
| 2.186999999999972 | 2.23 | 2.354 | 1.229 |
| 2.189999999999972 | 2.218 | 2.342 | 1.245 |
| 2.192999999999972 | 2.205 | 2.331 | 1.26 |
| 2.195999999999972 | 2.193 | 2.319 | 1.276 |
| 2.198999999999972 | 2.18 | 2.308 | 1.291 |
| 2.201999999999972 | 2.168 | 2.296 | 1.306 |
| 2.204999999999972 | 2.155 | 2.285 | 1.321 |
| 2.207999999999972 | 2.143 | 2.273 | 1.336 |
| 2.210999999999973 | 2.13 | 2.262 | 1.351 |
| 2.213999999999973 | 2.118 | 2.25 | 1.365 |
| 2.216999999999973 | 2.105 | 2.238 | 1.38 |
| 2.219999999999973 | 2.093 | 2.227 | 1.394 |
| 2.222999999999973 | 2.08 | 2.215 | 1.408 |
| 2.225999999999973 | 2.068 | 2.203 | 1.422 |
| 2.228999999999973 | 2.056 | 2.192 | 1.436 |
| 2.231999999999974 | 2.043 | 2.18 | 1.45 |
| 2.234999999999974 | 2.031 | 2.168 | 1.464 |
| 2.237999999999974 | 2.018 | 2.157 | 1.478 |
| 2.240999999999974 | 2.006 | 2.145 | 1.491 |
| 2.243999999999974 | 1.994 | 2.133 | 1.505 |
| 2.246999999999974 | 1.981 | 2.121 | 1.518 |
| 2.249999999999974 | 1.969 | 2.109 | 1.531 |
| 2.252999999999974 | 1.956 | 2.098 | 1.544 |
| 2.255999999999974 | 1.944 | 2.086 | 1.557 |
| 2.258999999999975 | 1.932 | 2.074 | 1.57 |
| 2.261999999999975 | 1.919 | 2.062 | 1.583 |
| 2.264999999999975 | 1.907 | 2.05 | 1.595 |
| 2.267999999999975 | 1.895 | 2.038 | 1.608 |
| 2.270999999999975 | 1.882 | 2.026 | 1.62 |
| 2.273999999999975 | 1.87 | 2.014 | 1.633 |
| 2.276999999999975 | 1.858 | 2.003 | 1.645 |
| 2.279999999999975 | 1.846 | 1.991 | 1.657 |
| 2.282999999999975 | 1.833 | 1.979 | 1.669 |
| 2.285999999999976 | 1.821 | 1.967 | 1.68 |
| 2.288999999999976 | 1.809 | 1.955 | 1.692 |
| 2.291999999999976 | 1.797 | 1.943 | 1.704 |
| 2.294999999999976 | 1.784 | 1.931 | 1.715 |
| 2.297999999999976 | 1.772 | 1.919 | 1.726 |
| 2.300999999999976 | 1.76 | 1.907 | 1.738 |
| 2.303999999999976 | 1.748 | 1.895 | 1.749 |
| 2.306999999999976 | 1.736 | 1.883 | 1.76 |
| 2.309999999999976 | 1.723 | 1.871 | 1.771 |
| 2.312999999999977 | 1.711 | 1.859 | 1.782 |
| 2.315999999999977 | 1.699 | 1.847 | 1.792 |
| 2.318999999999977 | 1.687 | 1.835 | 1.803 |
| 2.321999999999977 | 1.675 | 1.823 | 1.813 |
| 2.324999999999977 | 1.663 | 1.811 | 1.824 |
| 2.327999999999977 | 1.651 | 1.799 | 1.834 |
| 2.330999999999977 | 1.639 | 1.787 | 1.844 |
| 2.333999999999977 | 1.627 | 1.775 | 1.854 |
| 2.336999999999977 | 1.615 | 1.763 | 1.864 |
| 2.339999999999978 | 1.603 | 1.751 | 1.874 |
| 2.342999999999978 | 1.591 | 1.739 | 1.884 |
| 2.345999999999978 | 1.579 | 1.727 | 1.893 |
| 2.348999999999978 | 1.567 | 1.715 | 1.903 |
| 2.351999999999978 | 1.555 | 1.703 | 1.912 |
| 2.354999999999978 | 1.543 | 1.691 | 1.921 |
| 2.357999999999978 | 1.532 | 1.679 | 1.93 |
| 2.360999999999978 | 1.52 | 1.667 | 1.94 |
| 2.363999999999979 | 1.508 | 1.655 | 1.948 |
| 2.366999999999979 | 1.496 | 1.643 | 1.957 |
| 2.369999999999979 | 1.484 | 1.631 | 1.966 |
| 2.372999999999979 | 1.473 | 1.619 | 1.975 |
| 2.375999999999979 | 1.461 | 1.607 | 1.983 |
| 2.378999999999979 | 1.449 | 1.595 | 1.992 |
| 2.381999999999979 | 1.438 | 1.583 | 2 |
| 2.384999999999979 | 1.426 | 1.572 | 2.008 |
| 2.387999999999979 | 1.414 | 1.56 | 2.016 |
| 2.39099999999998 | 1.403 | 1.548 | 2.025 |
| 2.39399999999998 | 1.391 | 1.536 | 2.032 |
| 2.39699999999998 | 1.38 | 1.524 | 2.04 |
| 2.39999999999998 | 1.368 | 1.512 | 2.048 |
| 2.40299999999998 | 1.356 | 1.5 | 2.056 |
| 2.40599999999998 | 1.345 | 1.488 | 2.063 |
| 2.40899999999998 | 1.334 | 1.476 | 2.071 |
| 2.41199999999998 | 1.322 | 1.465 | 2.078 |
| 2.41499999999998 | 1.311 | 1.453 | 2.085 |
| 2.417999999999981 | 1.299 | 1.441 | 2.092 |
| 2.420999999999981 | 1.288 | 1.429 | 2.099 |
| 2.423999999999981 | 1.277 | 1.417 | 2.106 |
| 2.426999999999981 | 1.265 | 1.406 | 2.113 |
| 2.429999999999981 | 1.254 | 1.394 | 2.12 |
| 2.432999999999981 | 1.243 | 1.382 | 2.126 |
| 2.435999999999981 | 1.232 | 1.37 | 2.133 |
| 2.438999999999981 | 1.22 | 1.359 | 2.139 |
| 2.441999999999981 | 1.209 | 1.347 | 2.146 |
| 2.444999999999982 | 1.198 | 1.335 | 2.152 |
| 2.447999999999982 | 1.187 | 1.324 | 2.158 |
| 2.450999999999982 | 1.176 | 1.312 | 2.164 |
| 2.453999999999982 | 1.165 | 1.3 | 2.17 |
| 2.456999999999982 | 1.154 | 1.289 | 2.176 |
| 2.459999999999982 | 1.143 | 1.277 | 2.182 |
| 2.462999999999982 | 1.132 | 1.266 | 2.188 |
| 2.465999999999982 | 1.121 | 1.254 | 2.193 |
| 2.468999999999983 | 1.11 | 1.243 | 2.199 |
| 2.471999999999983 | 1.1 | 1.231 | 2.204 |
| 2.474999999999983 | 1.089 | 1.22 | 2.209 |
| 2.477999999999983 | 1.078 | 1.208 | 2.215 |
| 2.480999999999983 | 1.067 | 1.197 | 2.22 |
| 2.483999999999983 | 1.057 | 1.185 | 2.225 |
| 2.486999999999983 | 1.046 | 1.174 | 2.23 |
| 2.489999999999983 | 1.035 | 1.163 | 2.234 |
| 2.492999999999983 | 1.025 | 1.151 | 2.239 |
| 2.495999999999984 | 1.014 | 1.14 | 2.244 |
| 2.498999999999984 | 1.004 | 1.129 | 2.248 |
| 2.501999999999984 | 0.993 | 1.118 | 2.253 |
| 2.504999999999984 | 0.983 | 1.106 | 2.257 |
| 2.507999999999984 | 0.972 | 1.095 | 2.262 |
| 2.510999999999984 | 0.962 | 1.084 | 2.266 |
| 2.513999999999984 | 0.951 | 1.073 | 2.27 |
| 2.516999999999984 | 0.941 | 1.062 | 2.274 |
| 2.519999999999984 | 0.931 | 1.051 | 2.278 |
| 2.522999999999985 | 0.921 | 1.04 | 2.282 |
| 2.525999999999985 | 0.91 | 1.029 | 2.286 |
| 2.528999999999985 | 0.9 | 1.018 | 2.289 |
| 2.531999999999985 | 0.89 | 1.007 | 2.293 |
| 2.534999999999985 | 0.88 | 0.996 | 2.296 |
| 2.537999999999985 | 0.87 | 0.985 | 2.3 |
| 2.540999999999985 | 0.86 | 0.974 | 2.303 |
| 2.543999999999985 | 0.85 | 0.963 | 2.306 |
| 2.546999999999985 | 0.84 | 0.952 | 2.31 |
| 2.549999999999986 | 0.83 | 0.942 | 2.313 |
| 2.552999999999986 | 0.82 | 0.931 | 2.316 |
| 2.555999999999986 | 0.811 | 0.92 | 2.319 |
| 2.558999999999986 | 0.801 | 0.91 | 2.322 |
| 2.561999999999986 | 0.791 | 0.899 | 2.324 |
| 2.564999999999986 | 0.781 | 0.888 | 2.327 |
| 2.567999999999986 | 0.772 | 0.878 | 2.33 |
| 2.570999999999986 | 0.762 | 0.867 | 2.332 |
| 2.573999999999987 | 0.753 | 0.857 | 2.334 |
| 2.576999999999987 | 0.743 | 0.847 | 2.337 |
| 2.579999999999987 | 0.734 | 0.836 | 2.339 |
| 2.582999999999987 | 0.724 | 0.826 | 2.341 |
| 2.585999999999987 | 0.715 | 0.816 | 2.343 |
| 2.588999999999987 | 0.706 | 0.805 | 2.345 |
| 2.591999999999987 | 0.696 | 0.795 | 2.347 |
| 2.594999999999987 | 0.687 | 0.785 | 2.349 |
| 2.597999999999987 | 0.678 | 0.775 | 2.351 |
| 2.600999999999987 | 0.669 | 0.765 | 2.353 |
| 2.603999999999988 | 0.66 | 0.755 | 2.354 |
| 2.606999999999988 | 0.651 | 0.745 | 2.356 |
| 2.609999999999988 | 0.642 | 0.735 | 2.357 |
| 2.612999999999988 | 0.633 | 0.725 | 2.359 |
| 2.615999999999988 | 0.624 | 0.715 | 2.36 |
| 2.618999999999988 | 0.615 | 0.705 | 2.361 |
| 2.621999999999988 | 0.606 | 0.695 | 2.362 |
| 2.624999999999988 | 0.598 | 0.686 | 2.363 |
| 2.627999999999988 | 0.589 | 0.676 | 2.364 |
| 2.630999999999989 | 0.58 | 0.666 | 2.365 |
| 2.633999999999989 | 0.572 | 0.657 | 2.366 |
| 2.636999999999989 | 0.563 | 0.647 | 2.367 |
| 2.639999999999989 | 0.555 | 0.638 | 2.367 |
| 2.642999999999989 | 0.546 | 0.628 | 2.368 |
| 2.645999999999989 | 0.538 | 0.619 | 2.369 |
| 2.648999999999989 | 0.53 | 0.609 | 2.369 |
| 2.651999999999989 | 0.521 | 0.6 | 2.37 |
| 2.654999999999989 | 0.513 | 0.591 | 2.37 |
| 2.65799999999999 | 0.505 | 0.582 | 2.37 |
| 2.66099999999999 | 0.497 | 0.573 | 2.37 |
| 2.66399999999999 | 0.489 | 0.564 | 2.37 |
| 2.66699999999999 | 0.481 | 0.555 | 2.37 |
| 2.66999999999999 | 0.473 | 0.546 | 2.37 |
| 2.67299999999999 | 0.465 | 0.537 | 2.37 |
| 2.67599999999999 | 0.457 | 0.528 | 2.37 |
| 2.67899999999999 | 0.449 | 0.519 | 2.37 |
| 2.681999999999991 | 0.441 | 0.51 | 2.369 |
| 2.684999999999991 | 0.434 | 0.502 | 2.369 |
| 2.687999999999991 | 0.426 | 0.493 | 2.369 |
| 2.690999999999991 | 0.418 | 0.484 | 2.368 |
| 2.693999999999991 | 0.411 | 0.476 | 2.367 |
| 2.696999999999991 | 0.403 | 0.467 | 2.367 |
| 2.699999999999991 | 0.396 | 0.459 | 2.366 |
| 2.702999999999991 | 0.389 | 0.451 | 2.365 |
| 2.705999999999991 | 0.381 | 0.442 | 2.364 |
| 2.708999999999992 | 0.374 | 0.434 | 2.363 |
| 2.711999999999992 | 0.367 | 0.426 | 2.362 |
| 2.714999999999992 | 0.36 | 0.418 | 2.361 |
| 2.717999999999992 | 0.353 | 0.41 | 2.36 |
| 2.720999999999992 | 0.346 | 0.402 | 2.359 |
| 2.723999999999992 | 0.339 | 0.394 | 2.358 |
| 2.726999999999992 | 0.332 | 0.386 | 2.356 |
| 2.729999999999992 | 0.325 | 0.378 | 2.355 |
| 2.732999999999992 | 0.318 | 0.371 | 2.353 |
| 2.735999999999993 | 0.312 | 0.363 | 2.352 |
| 2.738999999999993 | 0.305 | 0.355 | 2.35 |
| 2.741999999999993 | 0.298 | 0.348 | 2.349 |
| 2.744999999999993 | 0.292 | 0.34 | 2.347 |
| 2.747999999999993 | 0.286 | 0.333 | 2.345 |
| 2.750999999999993 | 0.279 | 0.326 | 2.343 |
| 2.753999999999993 | 0.273 | 0.318 | 2.341 |
| 2.756999999999993 | 0.267 | 0.311 | 2.339 |
| 2.759999999999993 | 0.26 | 0.304 | 2.337 |
| 2.762999999999994 | 0.254 | 0.297 | 2.335 |
| 2.765999999999994 | 0.248 | 0.29 | 2.333 |
| 2.768999999999994 | 0.242 | 0.283 | 2.331 |
| 2.771999999999994 | 0.236 | 0.276 | 2.328 |
| 2.774999999999994 | 0.23 | 0.27 | 2.326 |
| 2.777999999999994 | 0.225 | 0.263 | 2.324 |
| 2.780999999999994 | 0.219 | 0.256 | 2.321 |
| 2.783999999999994 | 0.213 | 0.25 | 2.319 |
| 2.786999999999995 | 0.208 | 0.243 | 2.316 |
| 2.789999999999995 | 0.202 | 0.237 | 2.313 |
| 2.792999999999995 | 0.197 | 0.23 | 2.311 |
| 2.795999999999995 | 0.191 | 0.224 | 2.308 |
| 2.798999999999995 | 0.186 | 0.218 | 2.305 |
| 2.801999999999995 | 0.18 | 0.212 | 2.302 |
| 2.804999999999995 | 0.175 | 0.206 | 2.299 |
| 2.807999999999995 | 0.17 | 0.2 | 2.296 |
| 2.810999999999995 | 0.165 | 0.194 | 2.293 |
| 2.813999999999996 | 0.16 | 0.188 | 2.29 |
| 2.816999999999996 | 0.155 | 0.183 | 2.287 |
| 2.819999999999996 | 0.15 | 0.177 | 2.284 |
| 2.822999999999996 | 0.146 | 0.171 | 2.28 |
| 2.825999999999996 | 0.141 | 0.166 | 2.277 |
| 2.828999999999996 | 0.136 | 0.16 | 2.274 |
| 2.831999999999996 | 0.132 | 0.155 | 2.27 |
| 2.834999999999996 | 0.127 | 0.15 | 2.267 |
| 2.837999999999996 | 0.123 | 0.145 | 2.263 |
| 2.840999999999997 | 0.118 | 0.14 | 2.259 |
| 2.843999999999997 | 0.114 | 0.135 | 2.256 |
| 2.846999999999997 | 0.11 | 0.13 | 2.252 |
| 2.849999999999997 | 0.106 | 0.125 | 2.248 |
| 2.852999999999997 | 0.102 | 0.12 | 2.244 |
| 2.855999999999997 | 0.098 | 0.115 | 2.241 |
| 2.858999999999997 | 0.094 | 0.111 | 2.237 |
| 2.861999999999997 | 0.09 | 0.106 | 2.233 |
| 2.864999999999997 | 0.086 | 0.102 | 2.229 |
| 2.867999999999998 | 0.083 | 0.098 | 2.225 |
| 2.870999999999998 | 0.079 | 0.093 | 2.22 |
| 2.873999999999998 | 0.075 | 0.089 | 2.216 |
| 2.876999999999998 | 0.072 | 0.085 | 2.212 |
| 2.879999999999998 | 0.069 | 0.081 | 2.208 |
| 2.882999999999998 | 0.065 | 0.077 | 2.203 |
| 2.885999999999998 | 0.062 | 0.074 | 2.199 |
| 2.888999999999998 | 0.059 | 0.07 | 2.195 |
| 2.891999999999999 | 0.056 | 0.066 | 2.19 |
| 2.894999999999999 | 0.053 | 0.063 | 2.186 |
| 2.897999999999999 | 0.05 | 0.059 | 2.181 |
| 2.900999999999999 | 0.047 | 0.056 | 2.176 |
| 2.904 | 0.044 | 0.053 | 2.172 |
| 2.906999999999999 | 0.042 | 0.049 | 2.167 |
| 2.909999999999999 | 0.039 | 0.046 | 2.162 |
| 2.912999999999999 | 0.037 | 0.043 | 2.158 |
| 2.915999999999999 | 0.034 | 0.041 | 2.153 |
| 2.919 | 0.032 | 0.038 | 2.148 |
| 2.922 | 0.029 | 0.035 | 2.143 |
| 2.925 | 0.027 | 0.032 | 2.138 |
| 2.928 | 0.025 | 0.03 | 2.133 |
| 2.931 | 0.023 | 0.028 | 2.128 |
| 2.934 | 0.021 | 0.025 | 2.123 |
| 2.937 | 0.019 | 0.023 | 2.118 |
| 2.94 | 0.018 | 0.021 | 2.112 |
| 2.943 | 0.016 | 0.019 | 2.107 |
| 2.946000000000001 | 0.014 | 0.017 | 2.102 |
| 2.949000000000001 | 0.013 | 0.015 | 2.097 |
| 2.952000000000001 | 0.011 | 0.013 | 2.091 |
| 2.955000000000001 | 0.01 | 0.012 | 2.086 |
| 2.958000000000001 | 0.009 | 0.01 | 2.08 |
| 2.961000000000001 | 0.007 | 0.009 | 2.075 |
| 2.964000000000001 | 0.006 | 0.008 | 2.069 |
| 2.967000000000001 | 0.005 | 0.006 | 2.064 |
| 2.970000000000001 | 0.004 | 0.005 | 2.058 |
| 2.973000000000002 | 0.004 | 0.004 | 2.053 |
| 2.976000000000002 | 0.003 | 0.003 | 2.047 |
| 2.979000000000002 | 0.002 | 0.003 | 2.041 |
| 2.982000000000002 | 0.002 | 0.002 | 2.035 |
| 2.985000000000002 | 0.001 | 0.001 | 2.03 |
| 2.988000000000002 | 0.001 | 0.001 | 2.024 |
| 2.991000000000002 | 0 | 0 | 2.018 |
| 2.994000000000002 | 0 | 0 | 2.012 |
| 2.997000000000003 | 0 | 0 | 2.006 |
| 3.000000000000003 | 0 | 0 | 2 |
| 3.003000000000003 | 0 | 0 | 1.994 |
| 3.006000000000003 | 0 | 0 | 1.988 |
| 3.009000000000003 | 0 | 0 | 1.982 |
| 3.012000000000003 | 0.001 | 0.001 | 1.976 |
| 3.015000000000003 | 0.001 | 0.001 | 1.97 |
| 3.018000000000003 | 0.002 | 0.002 | 1.963 |
| 3.021000000000003 | 0.002 | 0.003 | 1.957 |
| 3.024000000000004 | 0.003 | 0.003 | 1.951 |
| 3.027000000000004 | 0.004 | 0.004 | 1.945 |
| 3.030000000000004 | 0.005 | 0.005 | 1.938 |
| 3.033000000000004 | 0.006 | 0.007 | 1.932 |
| 3.036000000000004 | 0.007 | 0.008 | 1.926 |
| 3.039000000000004 | 0.008 | 0.009 | 1.919 |
| 3.042000000000004 | 0.009 | 0.011 | 1.913 |
| 3.045000000000004 | 0.01 | 0.012 | 1.906 |
| 3.048000000000004 | 0.012 | 0.014 | 1.9 |
| 3.051000000000005 | 0.013 | 0.016 | 1.893 |
| 3.054000000000005 | 0.015 | 0.018 | 1.886 |
| 3.057000000000005 | 0.017 | 0.02 | 1.88 |
| 3.060000000000005 | 0.018 | 0.022 | 1.873 |
| 3.063000000000005 | 0.02 | 0.025 | 1.867 |
| 3.066000000000005 | 0.022 | 0.027 | 1.86 |
| 3.069000000000005 | 0.024 | 0.03 | 1.853 |
| 3.072000000000005 | 0.027 | 0.032 | 1.846 |
| 3.075000000000005 | 0.029 | 0.035 | 1.84 |
| 3.078000000000006 | 0.031 | 0.038 | 1.833 |
| 3.081000000000006 | 0.034 | 0.041 | 1.826 |
| 3.084000000000006 | 0.036 | 0.044 | 1.819 |
| 3.087000000000006 | 0.039 | 0.047 | 1.812 |
| 3.090000000000006 | 0.042 | 0.051 | 1.805 |
| 3.093000000000006 | 0.045 | 0.054 | 1.798 |
| 3.096000000000006 | 0.048 | 0.058 | 1.791 |
| 3.099000000000006 | 0.051 | 0.062 | 1.784 |
| 3.102000000000007 | 0.054 | 0.066 | 1.777 |
| 3.105000000000007 | 0.057 | 0.07 | 1.77 |
| 3.108000000000007 | 0.061 | 0.074 | 1.763 |
| 3.111000000000007 | 0.064 | 0.078 | 1.756 |
| 3.114000000000007 | 0.068 | 0.082 | 1.749 |
| 3.117000000000007 | 0.072 | 0.087 | 1.742 |
| 3.120000000000007 | 0.075 | 0.092 | 1.735 |
| 3.123000000000007 | 0.079 | 0.096 | 1.727 |
| 3.126000000000007 | 0.083 | 0.101 | 1.72 |
| 3.129000000000008 | 0.087 | 0.106 | 1.713 |
| 3.132000000000008 | 0.092 | 0.111 | 1.706 |
| 3.135000000000008 | 0.096 | 0.117 | 1.698 |
| 3.138000000000008 | 0.1 | 0.122 | 1.691 |
| 3.141000000000008 | 0.105 | 0.128 | 1.684 |
| 3.144000000000008 | 0.11 | 0.133 | 1.676 |
| 3.147000000000008 | 0.114 | 0.139 | 1.669 |
| 3.150000000000008 | 0.119 | 0.145 | 1.662 |
| 3.153000000000008 | 0.124 | 0.151 | 1.654 |
| 3.156000000000009 | 0.129 | 0.157 | 1.647 |
| 3.159000000000009 | 0.134 | 0.164 | 1.639 |
| 3.162000000000009 | 0.14 | 0.17 | 1.632 |
| 3.165000000000009 | 0.145 | 0.177 | 1.625 |
| 3.16800000000001 | 0.151 | 0.184 | 1.617 |
| 3.171000000000009 | 0.156 | 0.19 | 1.61 |
| 3.174000000000009 | 0.162 | 0.197 | 1.602 |
| 3.177000000000009 | 0.168 | 0.205 | 1.594 |
| 3.180000000000009 | 0.174 | 0.212 | 1.587 |
| 3.18300000000001 | 0.18 | 0.219 | 1.579 |
| 3.18600000000001 | 0.186 | 0.227 | 1.572 |
| 3.18900000000001 | 0.192 | 0.235 | 1.564 |
| 3.19200000000001 | 0.198 | 0.242 | 1.556 |
| 3.19500000000001 | 0.205 | 0.25 | 1.549 |
| 3.19800000000001 | 0.212 | 0.259 | 1.541 |
| 3.20100000000001 | 0.218 | 0.267 | 1.533 |
| 3.20400000000001 | 0.225 | 0.275 | 1.526 |
| 3.20700000000001 | 0.232 | 0.284 | 1.518 |
| 3.210000000000011 | 0.239 | 0.292 | 1.51 |
| 3.213000000000011 | 0.246 | 0.301 | 1.503 |
| 3.216000000000011 | 0.253 | 0.31 | 1.495 |
| 3.219000000000011 | 0.261 | 0.319 | 1.487 |
| 3.222000000000011 | 0.268 | 0.329 | 1.479 |
| 3.225000000000011 | 0.276 | 0.338 | 1.472 |
| 3.228000000000011 | 0.284 | 0.347 | 1.464 |
| 3.231000000000011 | 0.291 | 0.357 | 1.456 |
| 3.234000000000012 | 0.299 | 0.367 | 1.448 |
| 3.237000000000012 | 0.307 | 0.377 | 1.44 |
| 3.240000000000012 | 0.316 | 0.387 | 1.432 |
| 3.243000000000012 | 0.324 | 0.397 | 1.425 |
| 3.246000000000012 | 0.332 | 0.408 | 1.417 |
| 3.249000000000012 | 0.341 | 0.418 | 1.409 |
| 3.252000000000012 | 0.35 | 0.429 | 1.401 |
| 3.255000000000012 | 0.358 | 0.44 | 1.393 |
| 3.258000000000012 | 0.367 | 0.451 | 1.385 |
| 3.261000000000012 | 0.376 | 0.462 | 1.377 |
| 3.264000000000012 | 0.385 | 0.473 | 1.369 |
| 3.267000000000012 | 0.395 | 0.485 | 1.361 |
| 3.270000000000013 | 0.404 | 0.496 | 1.354 |
| 3.273000000000013 | 0.413 | 0.508 | 1.346 |
| 3.276000000000013 | 0.423 | 0.52 | 1.338 |
| 3.279000000000013 | 0.433 | 0.532 | 1.33 |
| 3.282000000000013 | 0.442 | 0.544 | 1.322 |
| 3.285000000000013 | 0.452 | 0.557 | 1.314 |
| 3.288000000000013 | 0.462 | 0.569 | 1.306 |
| 3.291000000000014 | 0.473 | 0.582 | 1.298 |
| 3.294000000000014 | 0.483 | 0.595 | 1.29 |
| 3.297000000000014 | 0.493 | 0.608 | 1.282 |
| 3.300000000000014 | 0.504 | 0.621 | 1.274 |
| 3.303000000000014 | 0.515 | 0.634 | 1.266 |
| 3.306000000000014 | 0.525 | 0.648 | 1.258 |
| 3.309000000000014 | 0.536 | 0.661 | 1.25 |
| 3.312000000000014 | 0.547 | 0.675 | 1.242 |
| 3.315000000000015 | 0.559 | 0.689 | 1.234 |
| 3.318000000000015 | 0.57 | 0.703 | 1.226 |
| 3.321000000000015 | 0.581 | 0.717 | 1.218 |
| 3.324000000000015 | 0.593 | 0.732 | 1.21 |
| 3.327000000000015 | 0.605 | 0.746 | 1.202 |
| 3.330000000000015 | 0.616 | 0.761 | 1.194 |
| 3.333000000000015 | 0.628 | 0.776 | 1.186 |
| 3.336000000000015 | 0.64 | 0.791 | 1.178 |
| 3.339000000000015 | 0.653 | 0.806 | 1.17 |
| 3.342000000000016 | 0.665 | 0.822 | 1.162 |
| 3.345000000000016 | 0.677 | 0.837 | 1.154 |
| 3.348000000000016 | 0.69 | 0.853 | 1.146 |
| 3.351000000000016 | 0.702 | 0.869 | 1.138 |
| 3.354000000000016 | 0.715 | 0.885 | 1.13 |
| 3.357000000000016 | 0.728 | 0.901 | 1.122 |
| 3.360000000000016 | 0.741 | 0.918 | 1.114 |
| 3.363000000000016 | 0.755 | 0.934 | 1.106 |
| 3.366000000000016 | 0.768 | 0.951 | 1.098 |
| 3.369000000000017 | 0.781 | 0.968 | 1.09 |
| 3.372000000000017 | 0.795 | 0.985 | 1.082 |
| 3.375000000000017 | 0.809 | 1.002 | 1.074 |
| 3.378000000000017 | 0.822 | 1.019 | 1.066 |
| 3.381000000000017 | 0.836 | 1.037 | 1.058 |
| 3.384000000000017 | 0.851 | 1.055 | 1.05 |
| 3.387000000000017 | 0.865 | 1.072 | 1.042 |
| 3.390000000000017 | 0.879 | 1.091 | 1.034 |
| 3.393000000000017 | 0.894 | 1.109 | 1.026 |
| 3.396000000000018 | 0.908 | 1.127 | 1.019 |
| 3.399000000000018 | 0.923 | 1.146 | 1.011 |
| 3.402000000000018 | 0.938 | 1.165 | 1.003 |
| 3.405000000000018 | 0.953 | 1.183 | 0.995 |
| 3.408000000000018 | 0.968 | 1.203 | 0.987 |
| 3.411000000000018 | 0.983 | 1.222 | 0.979 |
| 3.414000000000018 | 0.999 | 1.241 | 0.971 |
| 3.417000000000018 | 1.014 | 1.261 | 0.963 |
| 3.420000000000019 | 1.03 | 1.281 | 0.955 |
| 3.423000000000019 | 1.046 | 1.301 | 0.948 |
| 3.426000000000019 | 1.062 | 1.321 | 0.94 |
| 3.429000000000019 | 1.078 | 1.341 | 0.932 |
| 3.432000000000019 | 1.094 | 1.362 | 0.924 |
| 3.435000000000019 | 1.111 | 1.382 | 0.916 |
| 3.438000000000019 | 1.127 | 1.403 | 0.908 |
| 3.441000000000019 | 1.144 | 1.424 | 0.901 |
| 3.444000000000019 | 1.161 | 1.445 | 0.893 |
| 3.44700000000002 | 1.178 | 1.467 | 0.885 |
| 3.45000000000002 | 1.195 | 1.488 | 0.877 |
| 3.45300000000002 | 1.212 | 1.51 | 0.87 |
| 3.45600000000002 | 1.229 | 1.532 | 0.862 |
| 3.45900000000002 | 1.247 | 1.554 | 0.854 |
| 3.46200000000002 | 1.264 | 1.576 | 0.846 |
| 3.46500000000002 | 1.282 | 1.599 | 0.839 |
| 3.46800000000002 | 1.3 | 1.622 | 0.831 |
| 3.47100000000002 | 1.318 | 1.645 | 0.823 |
| 3.474000000000021 | 1.336 | 1.668 | 0.816 |
| 3.477000000000021 | 1.355 | 1.691 | 0.808 |
| 3.480000000000021 | 1.373 | 1.714 | 0.8 |
| 3.483000000000021 | 1.392 | 1.738 | 0.793 |
| 3.486000000000021 | 1.411 | 1.762 | 0.785 |
| 3.489000000000021 | 1.429 | 1.786 | 0.778 |
| 3.492000000000021 | 1.449 | 1.81 | 0.77 |
| 3.495000000000021 | 1.468 | 1.834 | 0.763 |
| 3.498000000000021 | 1.487 | 1.859 | 0.755 |
| 3.501000000000022 | 1.507 | 1.883 | 0.748 |
| 3.504000000000022 | 1.526 | 1.908 | 0.74 |
| 3.507000000000022 | 1.546 | 1.933 | 0.733 |
| 3.510000000000022 | 1.566 | 1.959 | 0.725 |
| 3.513000000000022 | 1.586 | 1.984 | 0.718 |
| 3.516000000000022 | 1.606 | 2.01 | 0.71 |
| 3.519000000000022 | 1.626 | 2.036 | 0.703 |
| 3.522000000000022 | 1.647 | 2.062 | 0.696 |
| 3.525000000000023 | 1.668 | 2.088 | 0.688 |
| 3.528000000000023 | 1.688 | 2.114 | 0.681 |
| 3.531000000000023 | 1.709 | 2.141 | 0.674 |
| 3.534000000000023 | 1.73 | 2.168 | 0.666 |
| 3.537000000000023 | 1.752 | 2.195 | 0.659 |
| 3.540000000000023 | 1.773 | 2.222 | 0.652 |
| 3.543000000000023 | 1.794 | 2.249 | 0.645 |
| 3.546000000000023 | 1.816 | 2.277 | 0.637 |
| 3.549000000000023 | 1.838 | 2.305 | 0.63 |
| 3.552000000000024 | 1.86 | 2.333 | 0.623 |
| 3.555000000000024 | 1.882 | 2.361 | 0.616 |
| 3.558000000000024 | 1.904 | 2.389 | 0.609 |
| 3.561000000000024 | 1.927 | 2.418 | 0.602 |
| 3.564000000000024 | 1.949 | 2.447 | 0.595 |
| 3.567000000000024 | 1.972 | 2.476 | 0.588 |
| 3.570000000000024 | 1.995 | 2.505 | 0.581 |
| 3.573000000000024 | 2.018 | 2.534 | 0.574 |
| 3.576000000000024 | 2.041 | 2.564 | 0.567 |
| 3.579000000000025 | 2.064 | 2.594 | 0.56 |
| 3.582000000000025 | 2.088 | 2.624 | 0.553 |
| 3.585000000000025 | 2.112 | 2.654 | 0.546 |
| 3.588000000000025 | 2.135 | 2.684 | 0.539 |
| 3.591000000000025 | 2.159 | 2.715 | 0.532 |
| 3.594000000000025 | 2.183 | 2.746 | 0.525 |
| 3.597000000000025 | 2.208 | 2.777 | 0.519 |
| 3.600000000000025 | 2.232 | 2.808 | 0.512 |
| 3.603000000000025 | 2.257 | 2.839 | 0.505 |
| 3.606000000000026 | 2.281 | 2.871 | 0.499 |
| 3.609000000000026 | 2.306 | 2.903 | 0.492 |
| 3.612000000000026 | 2.331 | 2.935 | 0.485 |
| 3.615000000000026 | 2.356 | 2.967 | 0.479 |
| 3.618000000000026 | 2.382 | 3 | 0.472 |
| 3.621000000000026 | 2.407 | 3.032 | 0.466 |
| 3.624000000000026 | 2.433 | 3.065 | 0.459 |
| 3.627000000000026 | 2.459 | 3.098 | 0.453 |
| 3.630000000000026 | 2.485 | 3.132 | 0.446 |
| 3.633000000000027 | 2.511 | 3.165 | 0.44 |
| 3.636000000000027 | 2.537 | 3.199 | 0.434 |
| 3.639000000000027 | 2.563 | 3.233 | 0.427 |
| 3.642000000000027 | 2.59 | 3.267 | 0.421 |
| 3.645000000000027 | 2.617 | 3.301 | 0.415 |
| 3.648000000000027 | 2.644 | 3.336 | 0.408 |
| 3.651000000000027 | 2.671 | 3.37 | 0.402 |
| 3.654000000000027 | 2.698 | 3.405 | 0.396 |
| 3.657000000000027 | 2.725 | 3.441 | 0.39 |
| 3.660000000000028 | 2.753 | 3.476 | 0.384 |
| 3.663000000000028 | 2.781 | 3.512 | 0.378 |
| 3.666000000000028 | 2.809 | 3.548 | 0.372 |
| 3.669000000000028 | 2.837 | 3.584 | 0.366 |
| 3.672000000000028 | 2.865 | 3.62 | 0.36 |
| 3.675000000000028 | 2.893 | 3.656 | 0.354 |
| 3.678000000000028 | 2.922 | 3.693 | 0.348 |
| 3.681000000000028 | 2.95 | 3.73 | 0.342 |
| 3.684000000000028 | 2.979 | 3.767 | 0.336 |
| 3.687000000000029 | 3.008 | 3.805 | 0.331 |
| 3.690000000000029 | 3.038 | 3.842 | 0.325 |
| 3.693000000000029 | 3.067 | 3.88 | 0.319 |
| 3.696000000000029 | 3.096 | 3.918 | 0.313 |
| 3.699000000000029 | 3.126 | 3.956 | 0.308 |
| 3.702000000000029 | 3.156 | 3.995 | 0.302 |
| 3.705000000000029 | 3.186 | 4.033 | 0.297 |
| 3.708000000000029 | 3.216 | 4.072 | 0.291 |
| 3.71100000000003 | 3.246 | 4.111 | 0.286 |
| 3.71400000000003 | 3.277 | 4.151 | 0.28 |
| 3.71700000000003 | 3.308 | 4.19 | 0.275 |
| 3.72000000000003 | 3.338 | 4.23 | 0.27 |
| 3.72300000000003 | 3.37 | 4.27 | 0.264 |
| 3.72600000000003 | 3.401 | 4.31 | 0.259 |
| 3.72900000000003 | 3.432 | 4.351 | 0.254 |
| 3.73200000000003 | 3.464 | 4.392 | 0.249 |
| 3.73500000000003 | 3.495 | 4.433 | 0.244 |
| 3.738000000000031 | 3.527 | 4.474 | 0.239 |
| 3.741000000000031 | 3.559 | 4.515 | 0.234 |
| 3.744000000000031 | 3.591 | 4.557 | 0.229 |
| 3.747000000000031 | 3.624 | 4.599 | 0.224 |
| 3.750000000000031 | 3.656 | 4.641 | 0.219 |
| 3.753000000000031 | 3.689 | 4.683 | 0.214 |
| 3.756000000000031 | 3.722 | 4.725 | 0.209 |
| 3.759000000000031 | 3.755 | 4.768 | 0.204 |
| 3.762000000000031 | 3.788 | 4.811 | 0.2 |
| 3.765000000000032 | 3.822 | 4.854 | 0.195 |
| 3.768000000000032 | 3.855 | 4.898 | 0.19 |
| 3.771000000000032 | 3.889 | 4.942 | 0.186 |
| 3.774000000000032 | 3.923 | 4.986 | 0.181 |
| 3.777000000000032 | 3.957 | 5.03 | 0.177 |
| 3.780000000000032 | 3.991 | 5.074 | 0.172 |
| 3.783000000000032 | 4.026 | 5.119 | 0.168 |
| 3.786000000000032 | 4.06 | 5.164 | 0.164 |
| 3.789000000000032 | 4.095 | 5.209 | 0.159 |
| 3.792000000000033 | 4.13 | 5.254 | 0.155 |
| 3.795000000000033 | 4.165 | 5.3 | 0.151 |
| 3.798000000000033 | 4.2 | 5.345 | 0.147 |
| 3.801000000000033 | 4.236 | 5.391 | 0.143 |
| 3.804000000000033 | 4.272 | 5.438 | 0.139 |
| 3.807000000000033 | 4.307 | 5.484 | 0.135 |
| 3.810000000000033 | 4.343 | 5.531 | 0.131 |
| 3.813000000000033 | 4.38 | 5.578 | 0.127 |
| 3.816000000000034 | 4.416 | 5.625 | 0.123 |
| 3.819000000000034 | 4.453 | 5.673 | 0.119 |
| 3.822000000000034 | 4.489 | 5.72 | 0.115 |
| 3.825000000000034 | 4.526 | 5.768 | 0.112 |
| 3.828000000000034 | 4.563 | 5.816 | 0.108 |
| 3.831000000000034 | 4.601 | 5.865 | 0.105 |
| 3.834000000000034 | 4.638 | 5.914 | 0.101 |
| 3.837000000000034 | 4.676 | 5.963 | 0.098 |
| 3.840000000000034 | 4.713 | 6.012 | 0.094 |
| 3.843000000000035 | 4.751 | 6.061 | 0.091 |
| 3.846000000000035 | 4.79 | 6.111 | 0.088 |
| 3.849000000000035 | 4.828 | 6.161 | 0.084 |
| 3.852000000000035 | 4.866 | 6.211 | 0.081 |
| 3.855000000000035 | 4.905 | 6.261 | 0.078 |
| 3.858000000000035 | 4.944 | 6.312 | 0.075 |
| 3.861000000000035 | 4.983 | 6.363 | 0.072 |
| 3.864000000000035 | 5.022 | 6.414 | 0.069 |
| 3.867000000000035 | 5.062 | 6.465 | 0.066 |
| 3.870000000000036 | 5.102 | 6.517 | 0.063 |
| 3.873000000000036 | 5.141 | 6.569 | 0.06 |
| 3.876000000000036 | 5.181 | 6.621 | 0.058 |
| 3.879000000000036 | 5.222 | 6.673 | 0.055 |
| 3.882000000000036 | 5.262 | 6.726 | 0.052 |
| 3.885000000000036 | 5.302 | 6.779 | 0.05 |
| 3.888000000000036 | 5.343 | 6.832 | 0.047 |
| 3.891000000000036 | 5.384 | 6.885 | 0.045 |
| 3.894000000000036 | 5.425 | 6.939 | 0.043 |
| 3.897000000000037 | 5.467 | 6.993 | 0.04 |
| 3.900000000000037 | 5.508 | 7.047 | 0.038 |
| 3.903000000000037 | 5.55 | 7.101 | 0.036 |
| 3.906000000000037 | 5.592 | 7.156 | 0.034 |
| 3.909000000000037 | 5.634 | 7.211 | 0.032 |
| 3.912000000000037 | 5.676 | 7.266 | 0.03 |
| 3.915000000000037 | 5.718 | 7.322 | 0.028 |
| 3.918000000000037 | 5.761 | 7.377 | 0.026 |
| 3.921000000000038 | 5.804 | 7.433 | 0.024 |
| 3.924000000000038 | 5.847 | 7.489 | 0.022 |
| 3.927000000000038 | 5.89 | 7.546 | 0.021 |
| 3.930000000000038 | 5.933 | 7.602 | 0.019 |
| 3.933000000000038 | 5.977 | 7.659 | 0.017 |
| 3.936000000000038 | 6.021 | 7.717 | 0.016 |
| 3.939000000000038 | 6.064 | 7.774 | 0.014 |
| 3.942000000000038 | 6.109 | 7.832 | 0.013 |
| 3.945000000000038 | 6.153 | 7.89 | 0.012 |
| 3.948000000000039 | 6.197 | 7.948 | 0.011 |
| 3.951000000000039 | 6.242 | 8.007 | 0.009 |
| 3.954000000000039 | 6.287 | 8.065 | 0.008 |
| 3.957000000000039 | 6.332 | 8.124 | 0.007 |
| 3.96000000000004 | 6.377 | 8.184 | 0.006 |
| 3.96300000000004 | 6.423 | 8.243 | 0.005 |
| 3.966000000000039 | 6.469 | 8.303 | 0.005 |
| 3.969000000000039 | 6.515 | 8.363 | 0.004 |
| 3.972000000000039 | 6.561 | 8.424 | 0.003 |
| 3.97500000000004 | 6.607 | 8.484 | 0.002 |
| 3.97800000000004 | 6.653 | 8.545 | 0.002 |
| 3.98100000000004 | 6.7 | 8.606 | 0.001 |
| 3.98400000000004 | 6.747 | 8.668 | 0.001 |
| 3.98700000000004 | 6.794 | 8.73 | 0.001 |
| 3.99000000000004 | 6.841 | 8.791 | 0 |
| 3.99300000000004 | 6.889 | 8.854 | 0 |
| 3.99600000000004 | 6.936 | 8.916 | 0 |
| 3.99900000000004 | 6.984 | 8.979 | 0 |
| 4.002000000000041 | 7.032 | 9.042 | 0 |
| 4.005000000000041 | 7.08 | 9.105 | 0 |
| 4.008000000000041 | 7.129 | 9.169 | 0 |
| 4.011000000000041 | 7.177 | 9.233 | 0 |
| 4.014000000000041 | 7.226 | 9.297 | 0.001 |
| 4.017000000000041 | 7.275 | 9.361 | 0.001 |
| 4.020000000000041 | 7.324 | 9.426 | 0.002 |
| 4.023000000000041 | 7.374 | 9.491 | 0.002 |
| 4.026000000000042 | 7.423 | 9.556 | 0.003 |
| 4.029000000000042 | 7.473 | 9.622 | 0.003 |
| 4.032000000000042 | 7.523 | 9.687 | 0.004 |
| 4.035000000000042 | 7.574 | 9.754 | 0.005 |
| 4.038000000000042 | 7.624 | 9.82 | 0.006 |
| 4.041000000000042 | 7.675 | 9.886 | 0.007 |
| 4.044000000000042 | 7.725 | 9.953 | 0.008 |
| 4.047000000000042 | 7.777 | 10.02 | 0.009 |
| 4.050000000000042 | 7.828 | 10.088 | 0.01 |
| 4.053000000000043 | 7.879 | 10.156 | 0.012 |
| 4.056000000000043 | 7.931 | 10.224 | 0.013 |
| 4.059000000000043 | 7.983 | 10.292 | 0.014 |
| 4.062000000000043 | 8.035 | 10.36 | 0.016 |
| 4.065000000000043 | 8.087 | 10.429 | 0.017 |
| 4.068000000000043 | 8.139 | 10.498 | 0.019 |
| 4.071000000000043 | 8.192 | 10.568 | 0.021 |
| 4.074000000000043 | 8.245 | 10.637 | 0.023 |
| 4.077000000000043 | 8.298 | 10.707 | 0.025 |
| 4.080000000000044 | 8.351 | 10.778 | 0.027 |
| 4.083000000000044 | 8.405 | 10.848 | 0.029 |
| 4.086000000000044 | 8.459 | 10.919 | 0.031 |
| 4.089000000000044 | 8.513 | 10.99 | 0.033 |
| 4.092000000000044 | 8.567 | 11.061 | 0.035 |
| 4.095000000000044 | 8.621 | 11.133 | 0.038 |
| 4.098000000000044 | 8.676 | 11.205 | 0.04 |
| 4.101000000000044 | 8.73 | 11.277 | 0.043 |
| 4.104000000000044 | 8.785 | 11.35 | 0.046 |
| 4.107000000000045 | 8.84 | 11.422 | 0.048 |
| 4.110000000000045 | 8.896 | 11.495 | 0.051 |
| 4.113000000000045 | 8.951 | 11.569 | 0.054 |
| 4.116000000000045 | 9.007 | 11.643 | 0.057 |
| 4.119000000000045 | 9.063 | 11.716 | 0.06 |
| 4.122000000000045 | 9.119 | 11.791 | 0.063 |
| 4.125000000000045 | 9.176 | 11.865 | 0.066 |
| 4.128000000000045 | 9.232 | 11.94 | 0.07 |
| 4.131000000000045 | 9.289 | 12.015 | 0.073 |
| 4.134000000000046 | 9.346 | 12.091 | 0.077 |
| 4.137000000000046 | 9.404 | 12.166 | 0.08 |
| 4.140000000000046 | 9.461 | 12.242 | 0.084 |
| 4.143000000000046 | 9.519 | 12.319 | 0.088 |
| 4.146000000000046 | 9.577 | 12.395 | 0.091 |
| 4.149000000000046 | 9.635 | 12.472 | 0.095 |
| 4.152000000000046 | 9.693 | 12.549 | 0.099 |
| 4.155000000000046 | 9.752 | 12.627 | 0.104 |
| 4.158000000000047 | 9.81 | 12.704 | 0.108 |
| 4.161000000000047 | 9.869 | 12.782 | 0.112 |
| 4.164000000000047 | 9.929 | 12.861 | 0.116 |
| 4.167000000000047 | 9.988 | 12.939 | 0.121 |
| 4.170000000000047 | 10.048 | 13.018 | 0.125 |
| 4.173000000000047 | 10.108 | 13.097 | 0.13 |
| 4.176000000000047 | 10.168 | 13.177 | 0.135 |
| 4.179000000000047 | 10.228 | 13.257 | 0.14 |
| 4.182000000000047 | 10.288 | 13.337 | 0.145 |
| 4.185000000000048 | 10.349 | 13.417 | 0.15 |
| 4.188000000000048 | 10.41 | 13.498 | 0.155 |
| 4.191000000000048 | 10.471 | 13.579 | 0.16 |
| 4.194000000000048 | 10.533 | 13.66 | 0.165 |
| 4.197000000000048 | 10.594 | 13.742 | 0.171 |
| 4.200000000000048 | 10.656 | 13.824 | 0.176 |
| 4.203000000000048 | 10.718 | 13.906 | 0.182 |
| 4.206000000000048 | 10.78 | 13.989 | 0.187 |
| 4.209000000000048 | 10.843 | 14.072 | 0.193 |
| 4.212000000000049 | 10.905 | 14.155 | 0.199 |
| 4.215000000000049 | 10.968 | 14.238 | 0.205 |
| 4.218000000000049 | 11.031 | 14.322 | 0.211 |
| 4.221000000000049 | 11.095 | 14.406 | 0.217 |
| 4.224000000000049 | 11.158 | 14.49 | 0.223 |
| 4.227000000000049 | 11.222 | 14.575 | 0.23 |
| 4.23000000000005 | 11.286 | 14.66 | 0.236 |
| 4.23300000000005 | 11.35 | 14.745 | 0.242 |
| 4.23600000000005 | 11.415 | 14.831 | 0.249 |
| 4.23900000000005 | 11.48 | 14.917 | 0.256 |
| 4.24200000000005 | 11.545 | 15.003 | 0.263 |
| 4.24500000000005 | 11.61 | 15.089 | 0.27 |
| 4.24800000000005 | 11.675 | 15.176 | 0.277 |
| 4.25100000000005 | 11.741 | 15.263 | 0.284 |
| 4.25400000000005 | 11.806 | 15.351 | 0.291 |
| 4.25700000000005 | 11.872 | 15.439 | 0.298 |
| 4.26000000000005 | 11.939 | 15.527 | 0.306 |
| 4.263000000000051 | 12.005 | 15.615 | 0.313 |
| 4.266000000000051 | 12.072 | 15.704 | 0.321 |
| 4.269000000000051 | 12.139 | 15.793 | 0.328 |
| 4.272000000000051 | 12.206 | 15.882 | 0.336 |
| 4.275000000000051 | 12.273 | 15.972 | 0.344 |
| 4.278000000000051 | 12.341 | 16.062 | 0.352 |
| 4.281000000000051 | 12.409 | 16.152 | 0.36 |
| 4.284000000000051 | 12.477 | 16.243 | 0.368 |
| 4.287000000000051 | 12.545 | 16.333 | 0.377 |
| 4.290000000000052 | 12.614 | 16.425 | 0.385 |
| 4.293000000000052 | 12.683 | 16.516 | 0.394 |
| 4.296000000000052 | 12.752 | 16.608 | 0.402 |
| 4.299000000000052 | 12.821 | 16.7 | 0.411 |
| 4.302000000000052 | 12.89 | 16.793 | 0.42 |
| 4.305000000000052 | 12.96 | 16.885 | 0.429 |
| 4.308000000000052 | 13.03 | 16.979 | 0.438 |
| 4.311000000000052 | 13.1 | 17.072 | 0.447 |
| 4.314000000000052 | 13.17 | 17.166 | 0.456 |
| 4.317000000000053 | 13.241 | 17.26 | 0.466 |
| 4.320000000000053 | 13.312 | 17.354 | 0.475 |
| 4.323000000000053 | 13.383 | 17.449 | 0.485 |
| 4.326000000000053 | 13.454 | 17.544 | 0.494 |
| 4.329000000000053 | 13.526 | 17.639 | 0.504 |
| 4.332000000000053 | 13.598 | 17.735 | 0.514 |
| 4.335000000000053 | 13.67 | 17.831 | 0.524 |
| 4.338000000000053 | 13.742 | 17.928 | 0.534 |
| 4.341000000000053 | 13.814 | 18.024 | 0.544 |
| 4.344000000000054 | 13.887 | 18.121 | 0.555 |
| 4.347000000000054 | 13.96 | 18.218 | 0.565 |
| 4.350000000000054 | 14.033 | 18.316 | 0.576 |
| 4.353000000000054 | 14.107 | 18.414 | 0.586 |
| 4.356000000000054 | 14.18 | 18.512 | 0.597 |
| 4.359000000000054 | 14.254 | 18.611 | 0.608 |
| 4.362000000000054 | 14.328 | 18.71 | 0.619 |
| 4.365000000000054 | 14.403 | 18.809 | 0.63 |
| 4.368000000000054 | 14.477 | 18.909 | 0.641 |
| 4.371000000000054 | 14.552 | 19.009 | 0.653 |
| 4.374000000000055 | 14.627 | 19.109 | 0.664 |
| 4.377000000000055 | 14.703 | 19.21 | 0.676 |
| 4.380000000000055 | 14.778 | 19.311 | 0.687 |
| 4.383000000000055 | 14.854 | 19.412 | 0.699 |
| 4.386000000000055 | 14.93 | 19.513 | 0.711 |
| 4.389000000000055 | 15.006 | 19.615 | 0.723 |
| 4.392000000000055 | 15.083 | 19.718 | 0.735 |
| 4.395000000000055 | 15.16 | 19.82 | 0.747 |
| 4.398000000000056 | 15.237 | 19.923 | 0.76 |
| 4.401000000000055 | 15.314 | 20.026 | 0.772 |
| 4.404000000000056 | 15.391 | 20.13 | 0.785 |
| 4.407000000000056 | 15.469 | 20.234 | 0.797 |
| 4.410000000000056 | 15.547 | 20.338 | 0.81 |
| 4.413000000000056 | 15.625 | 20.443 | 0.823 |
| 4.416000000000056 | 15.704 | 20.548 | 0.836 |
| 4.419000000000056 | 15.782 | 20.653 | 0.849 |
| 4.422000000000057 | 15.861 | 20.759 | 0.863 |
| 4.425000000000057 | 15.94 | 20.865 | 0.876 |
| 4.428000000000057 | 16.02 | 20.971 | 0.89 |
| 4.431000000000056 | 16.099 | 21.078 | 0.903 |
| 4.434000000000057 | 16.179 | 21.185 | 0.917 |
| 4.437000000000057 | 16.26 | 21.292 | 0.931 |
| 4.440000000000057 | 16.34 | 21.4 | 0.945 |
| 4.443000000000057 | 16.421 | 21.508 | 0.959 |
| 4.446000000000057 | 16.502 | 21.616 | 0.973 |
| 4.449000000000057 | 16.583 | 21.725 | 0.987 |
| 4.452000000000058 | 16.664 | 21.834 | 1.002 |
| 4.455000000000058 | 16.746 | 21.943 | 1.016 |
| 4.458000000000058 | 16.828 | 22.053 | 1.031 |
| 4.461000000000058 | 16.91 | 22.163 | 1.046 |
| 4.464000000000058 | 16.992 | 22.273 | 1.061 |
| 4.467000000000058 | 17.075 | 22.384 | 1.076 |
| 4.470000000000058 | 17.158 | 22.495 | 1.091 |
| 4.473000000000058 | 17.241 | 22.606 | 1.107 |
| 4.476000000000058 | 17.324 | 22.718 | 1.122 |
| 4.479000000000058 | 17.408 | 22.83 | 1.138 |
| 4.482000000000059 | 17.492 | 22.943 | 1.153 |
| 4.485000000000059 | 17.576 | 23.056 | 1.169 |
| 4.48800000000006 | 17.66 | 23.169 | 1.185 |
| 4.49100000000006 | 17.745 | 23.282 | 1.201 |
| 4.494000000000059 | 17.83 | 23.396 | 1.217 |
| 4.497000000000059 | 17.915 | 23.51 | 1.234 |
| 4.50000000000006 | 18 | 23.625 | 1.25 |
| 4.50300000000006 | 18.086 | 23.74 | 1.267 |
| 4.50600000000006 | 18.172 | 23.855 | 1.283 |
| 4.50900000000006 | 18.258 | 23.971 | 1.3 |
| 4.51200000000006 | 18.344 | 24.087 | 1.317 |
| 4.51500000000006 | 18.431 | 24.203 | 1.334 |
| 4.51800000000006 | 18.518 | 24.32 | 1.351 |
| 4.52100000000006 | 18.605 | 24.437 | 1.369 |
| 4.52400000000006 | 18.692 | 24.554 | 1.386 |
| 4.527000000000061 | 18.78 | 24.672 | 1.404 |
| 4.53000000000006 | 18.868 | 24.79 | 1.421 |
| 4.53300000000006 | 18.956 | 24.909 | 1.439 |
| 4.53600000000006 | 19.044 | 25.027 | 1.457 |
| 4.53900000000006 | 19.133 | 25.147 | 1.475 |
| 4.542000000000061 | 19.222 | 25.266 | 1.493 |
| 4.545000000000061 | 19.311 | 25.386 | 1.512 |
| 4.548000000000061 | 19.4 | 25.506 | 1.53 |
| 4.551000000000061 | 19.49 | 25.627 | 1.549 |
| 4.554000000000062 | 19.58 | 25.748 | 1.568 |
| 4.557000000000062 | 19.67 | 25.869 | 1.587 |
| 4.560000000000062 | 19.761 | 25.991 | 1.606 |
| 4.563000000000062 | 19.852 | 26.113 | 1.625 |
| 4.566000000000062 | 19.943 | 26.235 | 1.644 |
| 4.569000000000062 | 20.034 | 26.358 | 1.663 |
| 4.572000000000062 | 20.125 | 26.481 | 1.683 |
| 4.575000000000062 | 20.217 | 26.605 | 1.703 |
| 4.578000000000062 | 20.309 | 26.729 | 1.723 |
| 4.581000000000062 | 20.401 | 26.853 | 1.742 |
| 4.584000000000063 | 20.494 | 26.977 | 1.763 |
| 4.587000000000063 | 20.587 | 27.102 | 1.783 |
| 4.590000000000063 | 20.68 | 27.228 | 1.803 |
| 4.593000000000063 | 20.773 | 27.353 | 1.824 |
| 4.596000000000063 | 20.867 | 27.479 | 1.844 |
| 4.599000000000063 | 20.961 | 27.606 | 1.865 |
| 4.602000000000063 | 21.055 | 27.733 | 1.886 |
| 4.605000000000063 | 21.149 | 27.86 | 1.907 |
| 4.608000000000064 | 21.244 | 27.987 | 1.928 |
| 4.611000000000064 | 21.339 | 28.115 | 1.949 |
| 4.614000000000064 | 21.434 | 28.243 | 1.971 |
| 4.617000000000064 | 21.529 | 28.372 | 1.993 |
| 4.620000000000064 | 21.625 | 28.501 | 2.014 |
| 4.623000000000064 | 21.721 | 28.63 | 2.036 |
| 4.626000000000064 | 21.817 | 28.76 | 2.058 |
| 4.629000000000064 | 21.914 | 28.89 | 2.08 |
| 4.632000000000064 | 22.011 | 29.021 | 2.103 |
| 4.635000000000064 | 22.108 | 29.152 | 2.125 |
| 4.638000000000064 | 22.205 | 29.283 | 2.148 |
| 4.641000000000064 | 22.302 | 29.414 | 2.17 |
| 4.644000000000065 | 22.4 | 29.546 | 2.193 |
| 4.647000000000065 | 22.498 | 29.679 | 2.216 |
| 4.650000000000065 | 22.597 | 29.811 | 2.239 |
| 4.653000000000065 | 22.695 | 29.944 | 2.263 |
| 4.656000000000065 | 22.794 | 30.078 | 2.286 |
| 4.659000000000065 | 22.893 | 30.212 | 2.31 |
| 4.662000000000066 | 22.993 | 30.346 | 2.333 |
| 4.665000000000066 | 23.093 | 30.481 | 2.357 |
| 4.668000000000066 | 23.193 | 30.616 | 2.381 |
| 4.671000000000065 | 23.293 | 30.751 | 2.405 |
| 4.674000000000066 | 23.393 | 30.887 | 2.429 |
| 4.677000000000066 | 23.494 | 31.023 | 2.454 |
| 4.680000000000066 | 23.595 | 31.159 | 2.478 |
| 4.683000000000066 | 23.697 | 31.296 | 2.503 |
| 4.686000000000066 | 23.798 | 31.433 | 2.528 |
| 4.689000000000066 | 23.9 | 31.571 | 2.553 |
| 4.692000000000067 | 24.002 | 31.709 | 2.578 |
| 4.695000000000067 | 24.105 | 31.847 | 2.604 |
| 4.698000000000067 | 24.207 | 31.986 | 2.629 |
| 4.701000000000067 | 24.31 | 32.125 | 2.655 |
| 4.704000000000067 | 24.414 | 32.265 | 2.68 |
| 4.707000000000067 | 24.517 | 32.405 | 2.706 |
| 4.710000000000067 | 24.621 | 32.545 | 2.732 |
| 4.713000000000067 | 24.725 | 32.686 | 2.758 |
| 4.716000000000067 | 24.829 | 32.827 | 2.785 |
| 4.719000000000067 | 24.934 | 32.968 | 2.811 |
| 4.722000000000068 | 25.039 | 33.11 | 2.838 |
| 4.725000000000068 | 25.144 | 33.253 | 2.865 |
| 4.728000000000068 | 25.249 | 33.395 | 2.892 |
| 4.731000000000068 | 25.355 | 33.538 | 2.919 |
| 4.734000000000068 | 25.461 | 33.682 | 2.946 |
| 4.737000000000068 | 25.567 | 33.825 | 2.973 |
| 4.740000000000068 | 25.674 | 33.97 | 3.001 |
| 4.743000000000068 | 25.781 | 34.114 | 3.029 |
| 4.746000000000068 | 25.888 | 34.259 | 3.056 |
| 4.749000000000068 | 25.995 | 34.405 | 3.084 |
| 4.752000000000069 | 26.103 | 34.55 | 3.113 |
| 4.75500000000007 | 26.211 | 34.696 | 3.141 |
| 4.75800000000007 | 26.319 | 34.843 | 3.169 |
| 4.76100000000007 | 26.428 | 34.99 | 3.198 |
| 4.764000000000069 | 26.537 | 35.137 | 3.227 |
| 4.76700000000007 | 26.646 | 35.285 | 3.256 |
| 4.77000000000007 | 26.755 | 35.433 | 3.285 |
| 4.77300000000007 | 26.865 | 35.582 | 3.314 |
| 4.77600000000007 | 26.975 | 35.731 | 3.343 |
| 4.77900000000007 | 27.085 | 35.88 | 3.373 |
| 4.78200000000007 | 27.195 | 36.029 | 3.403 |
| 4.78500000000007 | 27.306 | 36.18 | 3.432 |
| 4.78800000000007 | 27.417 | 36.33 | 3.462 |
| 4.79100000000007 | 27.528 | 36.481 | 3.493 |
| 4.794000000000071 | 27.64 | 36.632 | 3.523 |
| 4.797000000000071 | 27.752 | 36.784 | 3.553 |
| 4.800000000000071 | 27.864 | 36.936 | 3.584 |
| 4.803000000000071 | 27.976 | 37.088 | 3.615 |
| 4.806000000000071 | 28.089 | 37.241 | 3.646 |
| 4.809000000000071 | 28.202 | 37.395 | 3.677 |
| 4.812000000000071 | 28.316 | 37.548 | 3.708 |
| 4.815000000000071 | 28.429 | 37.702 | 3.74 |
| 4.818000000000072 | 28.543 | 37.857 | 3.771 |
| 4.821000000000072 | 28.657 | 38.012 | 3.803 |
| 4.824000000000072 | 28.772 | 38.167 | 3.835 |
| 4.827000000000072 | 28.886 | 38.323 | 3.867 |
| 4.830000000000072 | 29.001 | 38.479 | 3.899 |
| 4.833000000000072 | 29.117 | 38.635 | 3.932 |
| 4.836000000000072 | 29.232 | 38.792 | 3.964 |
| 4.839000000000072 | 29.348 | 38.95 | 3.997 |
| 4.842000000000072 | 29.464 | 39.107 | 4.03 |
| 4.845000000000073 | 29.581 | 39.265 | 4.063 |
| 4.848000000000073 | 29.698 | 39.424 | 4.096 |
| 4.851000000000073 | 29.815 | 39.583 | 4.129 |
| 4.854000000000073 | 29.932 | 39.742 | 4.163 |
| 4.857000000000073 | 30.05 | 39.902 | 4.197 |
| 4.860000000000073 | 30.168 | 40.062 | 4.231 |
| 4.863000000000073 | 30.286 | 40.223 | 4.265 |
| 4.866000000000073 | 30.404 | 40.384 | 4.299 |
| 4.869000000000073 | 30.523 | 40.545 | 4.333 |
| 4.872000000000074 | 30.642 | 40.707 | 4.368 |
| 4.875000000000074 | 30.762 | 40.869 | 4.402 |
| 4.878000000000074 | 30.881 | 41.032 | 4.437 |
| 4.881000000000074 | 31.001 | 41.195 | 4.472 |
| 4.884000000000074 | 31.122 | 41.358 | 4.507 |
| 4.887000000000074 | 31.242 | 41.522 | 4.543 |
| 4.890000000000074 | 31.363 | 41.686 | 4.578 |
| 4.893000000000074 | 31.484 | 41.851 | 4.614 |
| 4.896000000000074 | 31.606 | 42.016 | 4.65 |
| 4.899000000000074 | 31.727 | 42.182 | 4.686 |
| 4.902000000000074 | 31.849 | 42.348 | 4.722 |
| 4.905000000000074 | 31.972 | 42.514 | 4.759 |
| 4.908000000000074 | 32.094 | 42.681 | 4.795 |
| 4.911000000000075 | 32.217 | 42.848 | 4.832 |
| 4.914000000000075 | 32.34 | 43.016 | 4.869 |
| 4.917000000000075 | 32.464 | 43.184 | 4.906 |
| 4.920000000000075 | 32.588 | 43.352 | 4.943 |
| 4.923000000000075 | 32.712 | 43.521 | 4.98 |
| 4.926000000000075 | 32.836 | 43.69 | 5.018 |
| 4.929000000000075 | 32.961 | 43.86 | 5.056 |
| 4.932000000000075 | 33.086 | 44.03 | 5.094 |
| 4.935000000000075 | 33.211 | 44.201 | 5.132 |
| 4.938000000000076 | 33.337 | 44.372 | 5.17 |
| 4.941000000000076 | 33.463 | 44.543 | 5.208 |
| 4.944000000000076 | 33.589 | 44.715 | 5.247 |
| 4.947000000000076 | 33.715 | 44.887 | 5.286 |
| 4.950000000000076 | 33.842 | 45.06 | 5.325 |
| 4.953000000000076 | 33.969 | 45.233 | 5.364 |
| 4.956000000000076 | 34.097 | 45.406 | 5.403 |
| 4.959000000000076 | 34.224 | 45.58 | 5.443 |
| 4.962000000000077 | 34.352 | 45.754 | 5.482 |
| 4.965000000000077 | 34.481 | 45.929 | 5.522 |
| 4.968000000000077 | 34.609 | 46.104 | 5.562 |
| 4.971000000000077 | 34.738 | 46.28 | 5.602 |
| 4.974000000000077 | 34.867 | 46.456 | 5.643 |
| 4.977000000000077 | 34.997 | 46.633 | 5.683 |
| 4.980000000000077 | 35.127 | 46.81 | 5.724 |
| 4.983000000000077 | 35.257 | 46.987 | 5.765 |
| 4.986000000000077 | 35.387 | 47.165 | 5.806 |
| 4.989000000000077 | 35.518 | 47.343 | 5.847 |
| 4.992000000000078 | 35.649 | 47.522 | 5.889 |
| 4.995000000000078 | 35.78 | 47.701 | 5.93 |
| 4.998000000000078 | 35.912 | 47.88 | 5.972 |
| 5.001000000000078 | 36.044 | 48.06 | 6.014 |
| 5.004000000000079 | 36.176 | 48.24 | 6.056 |
| 5.007000000000079 | 36.309 | 48.421 | 6.098 |
| 5.010000000000079 | 36.442 | 48.602 | 6.141 |
| 5.013000000000079 | 36.575 | 48.784 | 6.184 |
| 5.01600000000008 | 36.708 | 48.966 | 6.227 |
| 5.01900000000008 | 36.842 | 49.149 | 6.27 |
| 5.022000000000079 | 36.976 | 49.332 | 6.313 |
| 5.025000000000079 | 37.111 | 49.515 | 6.356 |
| 5.02800000000008 | 37.245 | 49.699 | 6.4 |
| 5.03100000000008 | 37.38 | 49.883 | 6.444 |
| 5.03400000000008 | 37.516 | 50.068 | 6.488 |
| 5.03700000000008 | 37.651 | 50.253 | 6.532 |
| 5.04000000000008 | 37.787 | 50.439 | 6.576 |
| 5.04300000000008 | 37.924 | 50.625 | 6.621 |
| 5.04600000000008 | 38.06 | 50.811 | 6.665 |
| 5.04900000000008 | 38.197 | 50.998 | 6.71 |
| 5.05200000000008 | 38.334 | 51.185 | 6.755 |
| 5.055000000000081 | 38.472 | 51.373 | 6.801 |
| 5.058000000000081 | 38.61 | 51.561 | 6.846 |
| 5.061000000000081 | 38.748 | 51.75 | 6.892 |
| 5.064000000000081 | 38.886 | 51.939 | 6.937 |
| 5.067000000000081 | 39.025 | 52.129 | 6.983 |
| 5.070000000000081 | 39.164 | 52.319 | 7.03 |
| 5.073000000000081 | 39.303 | 52.509 | 7.076 |
| 5.076000000000081 | 39.443 | 52.7 | 7.123 |
| 5.079000000000081 | 39.583 | 52.891 | 7.169 |
| 5.082000000000082 | 39.723 | 53.083 | 7.216 |
| 5.085000000000082 | 39.864 | 53.275 | 7.263 |
| 5.088000000000082 | 40.005 | 53.468 | 7.311 |
| 5.091000000000082 | 40.146 | 53.661 | 7.358 |
| 5.094000000000082 | 40.288 | 53.855 | 7.406 |
| 5.097000000000082 | 40.43 | 54.049 | 7.454 |
| 5.100000000000082 | 40.572 | 54.243 | 7.502 |
| 5.103000000000082 | 40.715 | 54.438 | 7.55 |
| 5.106000000000082 | 40.857 | 54.633 | 7.599 |
| 5.109000000000083 | 41.001 | 54.829 | 7.647 |
| 5.112000000000083 | 41.144 | 55.025 | 7.696 |
| 5.115000000000083 | 41.288 | 55.222 | 7.745 |
| 5.118000000000083 | 41.432 | 55.419 | 7.795 |
| 5.121000000000083 | 41.576 | 55.617 | 7.844 |
| 5.124000000000083 | 41.721 | 55.815 | 7.894 |
| 5.127000000000083 | 41.866 | 56.013 | 7.943 |
| 5.130000000000083 | 42.012 | 56.212 | 7.993 |
| 5.133000000000083 | 42.157 | 56.412 | 8.044 |
| 5.136000000000084 | 42.303 | 56.611 | 8.094 |
| 5.139000000000084 | 42.45 | 56.812 | 8.145 |
| 5.142000000000084 | 42.597 | 57.013 | 8.195 |
| 5.145000000000084 | 42.744 | 57.214 | 8.246 |
| 5.148000000000084 | 42.891 | 57.415 | 8.298 |
| 5.151000000000084 | 43.039 | 57.618 | 8.349 |
| 5.154000000000084 | 43.186 | 57.82 | 8.4 |
| 5.157000000000084 | 43.335 | 58.023 | 8.452 |
| 5.160000000000085 | 43.483 | 58.227 | 8.504 |
| 5.163000000000085 | 43.632 | 58.431 | 8.556 |
| 5.166000000000085 | 43.782 | 58.635 | 8.609 |
| 5.169000000000085 | 43.931 | 58.84 | 8.661 |
| 5.172000000000085 | 44.081 | 59.045 | 8.714 |
| 5.175000000000085 | 44.231 | 59.251 | 8.767 |
| 5.178000000000085 | 44.382 | 59.457 | 8.82 |
| 5.181000000000085 | 44.533 | 59.664 | 8.873 |
| 5.184000000000085 | 44.684 | 59.871 | 8.927 |
| 5.187000000000086 | 44.836 | 60.079 | 8.981 |
| 5.190000000000086 | 44.987 | 60.287 | 9.035 |
| 5.193000000000086 | 45.14 | 60.496 | 9.089 |
| 5.196000000000086 | 45.292 | 60.705 | 9.143 |
| 5.199000000000086 | 45.445 | 60.914 | 9.198 |
| 5.202000000000086 | 45.598 | 61.124 | 9.253 |
| 5.205000000000086 | 45.752 | 61.334 | 9.307 |
| 5.208000000000086 | 45.905 | 61.545 | 9.363 |
| 5.211000000000086 | 46.06 | 61.757 | 9.418 |
| 5.214000000000087 | 46.214 | 61.969 | 9.474 |
| 5.217000000000087 | 46.369 | 62.181 | 9.529 |
| 5.220000000000087 | 46.524 | 62.394 | 9.585 |
| 5.223000000000087 | 46.68 | 62.607 | 9.641 |
| 5.226000000000087 | 46.835 | 62.82 | 9.698 |
| 5.229000000000087 | 46.992 | 63.035 | 9.754 |
| 5.232000000000087 | 47.148 | 63.249 | 9.811 |
| 5.235000000000087 | 47.305 | 63.464 | 9.868 |
| 5.238000000000087 | 47.462 | 63.68 | 9.925 |
| 5.241000000000087 | 47.619 | 63.896 | 9.983 |
| 5.244000000000088 | 47.777 | 64.112 | 10.04 |
| 5.247000000000088 | 47.935 | 64.329 | 10.098 |
| 5.250000000000088 | 48.094 | 64.547 | 10.156 |
| 5.253000000000088 | 48.253 | 64.765 | 10.214 |
| 5.256000000000088 | 48.412 | 64.983 | 10.273 |
| 5.259000000000088 | 48.571 | 65.202 | 10.332 |
| 5.262000000000088 | 48.731 | 65.421 | 10.39 |
| 5.265000000000088 | 48.891 | 65.641 | 10.449 |
| 5.268000000000089 | 49.052 | 65.862 | 10.509 |
| 5.271000000000088 | 49.212 | 66.082 | 10.568 |
| 5.274000000000089 | 49.373 | 66.304 | 10.628 |
| 5.277000000000089 | 49.535 | 66.525 | 10.688 |
| 5.28000000000009 | 49.697 | 66.747 | 10.748 |
| 5.28300000000009 | 49.859 | 66.97 | 10.808 |
| 5.28600000000009 | 50.021 | 67.193 | 10.869 |
| 5.28900000000009 | 50.184 | 67.417 | 10.929 |
| 5.292000000000089 | 50.347 | 67.641 | 10.99 |
| 5.29500000000009 | 50.511 | 67.866 | 11.052 |
| 5.29800000000009 | 50.675 | 68.091 | 11.113 |
| 5.30100000000009 | 50.839 | 68.316 | 11.175 |
| 5.30400000000009 | 51.003 | 68.542 | 11.236 |
| 5.30700000000009 | 51.168 | 68.769 | 11.298 |
| 5.31000000000009 | 51.333 | 68.996 | 11.361 |
| 5.31300000000009 | 51.499 | 69.223 | 11.423 |
| 5.31600000000009 | 51.665 | 69.451 | 11.486 |
| 5.31900000000009 | 51.831 | 69.68 | 11.549 |
| 5.322000000000091 | 51.997 | 69.909 | 11.612 |
| 5.325000000000091 | 52.164 | 70.138 | 11.675 |
| 5.328000000000091 | 52.332 | 70.368 | 11.738 |
| 5.331000000000091 | 52.499 | 70.598 | 11.802 |
| 5.334000000000091 | 52.667 | 70.829 | 11.866 |
| 5.337000000000091 | 52.835 | 71.06 | 11.93 |
| 5.340000000000091 | 53.004 | 71.292 | 11.995 |
| 5.343000000000091 | 53.173 | 71.525 | 12.059 |
| 5.346000000000092 | 53.342 | 71.757 | 12.124 |
| 5.349000000000092 | 53.512 | 71.991 | 12.189 |
| 5.352000000000092 | 53.682 | 72.225 | 12.254 |
| 5.355000000000092 | 53.852 | 72.459 | 12.32 |
| 5.358000000000092 | 54.023 | 72.694 | 12.385 |
| 5.361000000000092 | 54.194 | 72.929 | 12.451 |
| 5.364000000000092 | 54.365 | 73.165 | 12.517 |
| 5.367000000000092 | 54.537 | 73.401 | 12.584 |
| 5.370000000000092 | 54.709 | 73.638 | 12.65 |
| 5.373000000000093 | 54.881 | 73.875 | 12.717 |
| 5.376000000000093 | 55.054 | 74.112 | 12.784 |
| 5.379000000000093 | 55.227 | 74.351 | 12.851 |
| 5.382000000000093 | 55.4 | 74.589 | 12.919 |
| 5.385000000000093 | 55.574 | 74.829 | 12.986 |
| 5.388000000000093 | 55.748 | 75.068 | 13.054 |
| 5.391000000000093 | 55.923 | 75.308 | 13.122 |
| 5.394000000000093 | 56.097 | 75.549 | 13.191 |
| 5.397000000000093 | 56.272 | 75.79 | 13.259 |
| 5.400000000000094 | 56.448 | 76.032 | 13.328 |
| 5.403000000000094 | 56.624 | 76.274 | 13.397 |
| 5.406000000000094 | 56.8 | 76.517 | 13.466 |
| 5.409000000000094 | 56.977 | 76.76 | 13.536 |
| 5.412000000000094 | 57.154 | 77.004 | 13.605 |
| 5.415000000000094 | 57.331 | 77.248 | 13.675 |
| 5.418000000000094 | 57.508 | 77.492 | 13.745 |
| 5.421000000000094 | 57.686 | 77.738 | 13.816 |
| 5.424000000000094 | 57.865 | 77.983 | 13.886 |
| 5.427000000000095 | 58.043 | 78.229 | 13.957 |
| 5.430000000000094 | 58.222 | 78.476 | 14.028 |
| 5.433000000000094 | 58.402 | 78.723 | 14.099 |
| 5.436000000000094 | 58.581 | 78.971 | 14.171 |
| 5.439000000000095 | 58.761 | 79.219 | 14.242 |
| 5.442000000000095 | 58.942 | 79.468 | 14.314 |
| 5.445000000000095 | 59.123 | 79.717 | 14.386 |
| 5.448000000000095 | 59.304 | 79.967 | 14.459 |
| 5.451000000000095 | 59.485 | 80.217 | 14.531 |
| 5.454000000000096 | 59.667 | 80.468 | 14.604 |
| 5.457000000000096 | 59.849 | 80.719 | 14.677 |
| 5.460000000000096 | 60.032 | 80.97 | 14.751 |
| 5.463000000000096 | 60.215 | 81.223 | 14.824 |
| 5.466000000000096 | 60.398 | 81.475 | 14.898 |
| 5.469000000000096 | 60.582 | 81.729 | 14.972 |
| 5.472000000000096 | 60.766 | 81.982 | 15.046 |
| 5.475000000000096 | 60.95 | 82.237 | 15.121 |
| 5.478000000000096 | 61.135 | 82.491 | 15.195 |
| 5.481000000000096 | 61.32 | 82.747 | 15.27 |
| 5.484000000000097 | 61.505 | 83.002 | 15.345 |
| 5.487000000000097 | 61.691 | 83.259 | 15.421 |
| 5.490000000000097 | 61.877 | 83.515 | 15.496 |
| 5.493000000000097 | 62.063 | 83.773 | 15.572 |
| 5.496000000000097 | 62.25 | 84.03 | 15.648 |
| 5.499000000000097 | 62.438 | 84.289 | 15.725 |
| 5.502000000000097 | 62.625 | 84.548 | 15.801 |
| 5.505000000000098 | 62.813 | 84.807 | 15.878 |
| 5.508000000000098 | 63.001 | 85.067 | 15.955 |
| 5.511000000000098 | 63.19 | 85.327 | 16.032 |
| 5.514000000000098 | 63.379 | 85.588 | 16.11 |
| 5.517000000000098 | 63.568 | 85.85 | 16.187 |
| 5.520000000000098 | 63.758 | 86.111 | 16.265 |
| 5.523000000000098 | 63.948 | 86.374 | 16.343 |
| 5.526000000000098 | 64.139 | 86.637 | 16.422 |
| 5.529000000000098 | 64.329 | 86.9 | 16.5 |
| 5.532000000000099 | 64.521 | 87.164 | 16.579 |
| 5.535000000000099 | 64.712 | 87.429 | 16.659 |
| 5.538000000000099 | 64.904 | 87.694 | 16.738 |
| 5.541000000000099 | 65.096 | 87.959 | 16.817 |
| 5.544000000000099 | 65.289 | 88.225 | 16.897 |
| 5.547000000000099 | 65.482 | 88.492 | 16.977 |
| 5.550000000000099 | 65.675 | 88.759 | 17.058 |
| 5.553000000000099 | 65.869 | 89.027 | 17.138 |
| 5.5560000000001 | 66.063 | 89.295 | 17.219 |
| 5.5590000000001 | 66.258 | 89.564 | 17.3 |
| 5.5620000000001 | 66.452 | 89.833 | 17.381 |
| 5.5650000000001 | 66.648 | 90.102 | 17.463 |
| 5.5680000000001 | 66.843 | 90.373 | 17.545 |
| 5.5710000000001 | 67.039 | 90.643 | 17.627 |
| 5.5740000000001 | 67.235 | 90.915 | 17.709 |
| 5.5770000000001 | 67.432 | 91.187 | 17.791 |
| 5.5800000000001 | 67.629 | 91.459 | 17.874 |
| 5.5830000000001 | 67.826 | 91.732 | 17.957 |
| 5.5860000000001 | 68.024 | 92.005 | 18.04 |
| 5.5890000000001 | 68.222 | 92.279 | 18.124 |
| 5.592000000000101 | 68.421 | 92.554 | 18.208 |
| 5.595000000000101 | 68.62 | 92.829 | 18.292 |
| 5.598000000000101 | 68.819 | 93.104 | 18.376 |
| 5.601000000000101 | 69.019 | 93.38 | 18.46 |
| 5.604000000000101 | 69.219 | 93.657 | 18.545 |
| 5.607000000000101 | 69.419 | 93.934 | 18.63 |
| 5.610000000000101 | 69.62 | 94.211 | 18.715 |
| 5.613000000000102 | 69.821 | 94.489 | 18.8 |
| 5.616000000000102 | 70.022 | 94.768 | 18.886 |
| 5.619000000000102 | 70.224 | 95.047 | 18.972 |
| 5.622000000000102 | 70.426 | 95.327 | 19.058 |
| 5.625000000000102 | 70.629 | 95.607 | 19.145 |
| 5.628000000000102 | 70.832 | 95.888 | 19.231 |
| 5.631000000000102 | 71.035 | 96.17 | 19.318 |
| 5.634000000000102 | 71.239 | 96.451 | 19.405 |
| 5.637000000000102 | 71.443 | 96.734 | 19.493 |
| 5.640000000000103 | 71.647 | 97.017 | 19.58 |
| 5.643000000000103 | 71.852 | 97.3 | 19.668 |
| 5.646000000000103 | 72.058 | 97.584 | 19.756 |
| 5.649000000000103 | 72.263 | 97.869 | 19.845 |
| 5.652000000000103 | 72.469 | 98.154 | 19.933 |
| 5.655000000000103 | 72.675 | 98.44 | 20.022 |
| 5.658000000000103 | 72.882 | 98.726 | 20.111 |
| 5.661000000000103 | 73.089 | 99.013 | 20.201 |
| 5.664000000000104 | 73.297 | 99.3 | 20.29 |
| 5.667000000000104 | 73.505 | 99.588 | 20.38 |
| 5.670000000000104 | 73.713 | 99.876 | 20.471 |
| 5.673000000000104 | 73.921 | 100.165 | 20.561 |
| 5.676000000000104 | 74.13 | 100.454 | 20.652 |
| 5.679000000000104 | 74.34 | 100.744 | 20.743 |
| 5.682000000000104 | 74.55 | 101.035 | 20.834 |
| 5.685000000000104 | 74.76 | 101.326 | 20.925 |
| 5.688000000000104 | 74.97 | 101.617 | 21.017 |
| 5.691000000000104 | 75.181 | 101.909 | 21.109 |
| 5.694000000000105 | 75.392 | 102.202 | 21.201 |
| 5.697000000000105 | 75.604 | 102.495 | 21.293 |
| 5.700000000000104 | 75.816 | 102.789 | 21.386 |
| 5.703000000000105 | 76.028 | 103.083 | 21.479 |
| 5.706000000000105 | 76.241 | 103.378 | 21.572 |
| 5.709000000000105 | 76.454 | 103.674 | 21.666 |
| 5.712000000000105 | 76.668 | 103.969 | 21.759 |
| 5.715000000000105 | 76.882 | 104.266 | 21.853 |
| 5.718000000000105 | 77.096 | 104.563 | 21.948 |
| 5.721000000000105 | 77.311 | 104.861 | 22.042 |
| 5.724000000000106 | 77.526 | 105.159 | 22.137 |
| 5.727000000000106 | 77.741 | 105.457 | 22.232 |
| 5.730000000000106 | 77.957 | 105.757 | 22.327 |
| 5.733000000000106 | 78.174 | 106.056 | 22.423 |
| 5.736000000000106 | 78.39 | 106.357 | 22.518 |
| 5.739000000000106 | 78.607 | 106.658 | 22.614 |
| 5.742000000000106 | 78.825 | 106.959 | 22.711 |
| 5.745000000000106 | 79.042 | 107.261 | 22.807 |
| 5.748000000000106 | 79.261 | 107.564 | 22.904 |
| 5.751000000000106 | 79.479 | 107.867 | 23.001 |
| 5.754000000000107 | 79.698 | 108.17 | 23.098 |
| 5.757000000000107 | 79.917 | 108.475 | 23.196 |
| 5.760000000000107 | 80.137 | 108.779 | 23.294 |
| 5.763000000000107 | 80.357 | 109.085 | 23.392 |
| 5.766000000000107 | 80.578 | 109.391 | 23.49 |
| 5.769000000000107 | 80.799 | 109.697 | 23.589 |
| 5.772000000000107 | 81.02 | 110.004 | 23.688 |
| 5.775000000000107 | 81.242 | 110.311 | 23.787 |
| 5.778000000000107 | 81.464 | 110.62 | 23.887 |
| 5.781000000000107 | 81.686 | 110.928 | 23.986 |
| 5.784000000000108 | 81.909 | 111.237 | 24.086 |
| 5.787000000000108 | 82.132 | 111.547 | 24.187 |
| 5.790000000000108 | 82.356 | 111.858 | 24.287 |
| 5.793000000000108 | 82.58 | 112.168 | 24.388 |
| 5.796000000000108 | 82.804 | 112.48 | 24.489 |
| 5.799000000000108 | 83.029 | 112.792 | 24.59 |
| 5.802000000000109 | 83.254 | 113.104 | 24.692 |
| 5.805000000000109 | 83.48 | 113.418 | 24.794 |
| 5.80800000000011 | 83.706 | 113.731 | 24.896 |
| 5.81100000000011 | 83.932 | 114.046 | 24.998 |
| 5.814000000000109 | 84.159 | 114.36 | 25.101 |
| 5.817000000000109 | 84.386 | 114.676 | 25.204 |
| 5.820000000000109 | 84.614 | 114.992 | 25.307 |
| 5.82300000000011 | 84.841 | 115.308 | 25.41 |
| 5.82600000000011 | 85.07 | 115.625 | 25.514 |
| 5.82900000000011 | 85.299 | 115.943 | 25.618 |
| 5.83200000000011 | 85.528 | 116.261 | 25.722 |
| 5.83500000000011 | 85.757 | 116.58 | 25.827 |
| 5.83800000000011 | 85.987 | 116.899 | 25.931 |
| 5.84100000000011 | 86.217 | 117.219 | 26.036 |
| 5.84400000000011 | 86.448 | 117.54 | 26.142 |
| 5.84700000000011 | 86.679 | 117.861 | 26.247 |
| 5.850000000000111 | 86.911 | 118.182 | 26.353 |
| 5.853000000000111 | 87.143 | 118.505 | 26.459 |
| 5.856000000000111 | 87.375 | 118.827 | 26.566 |
| 5.859000000000111 | 87.608 | 119.151 | 26.672 |
| 5.862000000000111 | 87.841 | 119.475 | 26.779 |
| 5.865000000000111 | 88.074 | 119.799 | 26.887 |
| 5.868000000000111 | 88.308 | 120.124 | 26.994 |
| 5.871000000000111 | 88.542 | 120.45 | 27.102 |
| 5.874000000000112 | 88.777 | 120.776 | 27.21 |
| 5.877000000000112 | 89.012 | 121.103 | 27.318 |
| 5.880000000000112 | 89.248 | 121.43 | 27.427 |
| 5.883000000000112 | 89.484 | 121.758 | 27.536 |
| 5.886000000000112 | 89.72 | 122.086 | 27.645 |
| 5.889000000000112 | 89.957 | 122.415 | 27.754 |
| 5.892000000000112 | 90.194 | 122.745 | 27.864 |
| 5.895000000000112 | 90.431 | 123.075 | 27.974 |
| 5.898000000000112 | 90.669 | 123.406 | 28.084 |
| 5.901000000000112 | 90.907 | 123.738 | 28.195 |
| 5.904000000000113 | 91.146 | 124.069 | 28.306 |
| 5.907000000000113 | 91.385 | 124.402 | 28.417 |
| 5.910000000000113 | 91.625 | 124.735 | 28.528 |
| 5.913000000000113 | 91.865 | 125.069 | 28.64 |
| 5.916000000000113 | 92.105 | 125.403 | 28.752 |
| 5.919000000000113 | 92.346 | 125.738 | 28.864 |
| 5.922000000000113 | 92.587 | 126.073 | 28.976 |
| 5.925000000000113 | 92.829 | 126.409 | 29.089 |
| 5.928000000000114 | 93.07 | 126.746 | 29.202 |
| 5.931000000000113 | 93.313 | 127.083 | 29.316 |
| 5.934000000000114 | 93.556 | 127.421 | 29.429 |
| 5.937000000000114 | 93.799 | 127.759 | 29.543 |
| 5.940000000000114 | 94.042 | 128.098 | 29.657 |
| 5.943000000000114 | 94.286 | 128.438 | 29.772 |
| 5.946000000000114 | 94.531 | 128.778 | 29.886 |
| 5.949000000000114 | 94.776 | 129.118 | 30.001 |
| 5.952000000000114 | 95.021 | 129.46 | 30.117 |
| 5.955000000000114 | 95.266 | 129.802 | 30.232 |
| 5.958000000000114 | 95.512 | 130.144 | 30.348 |
| 5.961000000000114 | 95.759 | 130.487 | 30.464 |
| 5.964000000000115 | 96.006 | 130.831 | 30.581 |
| 5.967000000000115 | 96.253 | 131.175 | 30.697 |
| 5.970000000000115 | 96.501 | 131.52 | 30.814 |
| 5.973000000000115 | 96.749 | 131.865 | 30.932 |
| 5.976000000000115 | 96.997 | 132.211 | 31.049 |
| 5.979000000000115 | 97.246 | 132.558 | 31.167 |
| 5.982000000000115 | 97.495 | 132.905 | 31.285 |
| 5.985000000000115 | 97.745 | 133.252 | 31.404 |
| 5.988000000000115 | 97.995 | 133.601 | 31.522 |
| 5.991000000000115 | 98.246 | 133.95 | 31.641 |
| 5.994000000000116 | 98.497 | 134.299 | 31.761 |
| 5.997000000000116 | 98.748 | 134.649 | 31.88 |
| 6.000000000000116 | 99 | 135 | 32 |